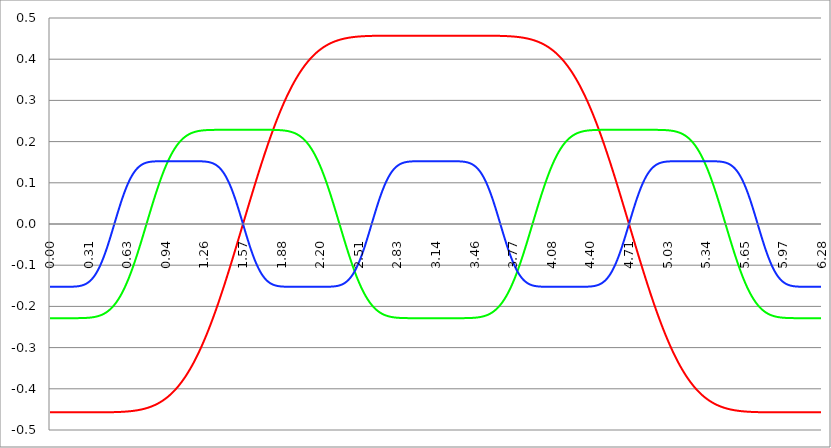
| Category | Series 1 | Series 0 | Series 2 |
|---|---|---|---|
| 0.0 | -0.457 | -0.229 | -0.152 |
| 0.00314159265358979 | -0.457 | -0.229 | -0.152 |
| 0.00628318530717958 | -0.457 | -0.229 | -0.152 |
| 0.00942477796076938 | -0.457 | -0.229 | -0.152 |
| 0.0125663706143592 | -0.457 | -0.229 | -0.152 |
| 0.015707963267949 | -0.457 | -0.229 | -0.152 |
| 0.0188495559215388 | -0.457 | -0.229 | -0.152 |
| 0.0219911485751285 | -0.457 | -0.229 | -0.152 |
| 0.0251327412287183 | -0.457 | -0.229 | -0.152 |
| 0.0282743338823081 | -0.457 | -0.229 | -0.152 |
| 0.0314159265358979 | -0.457 | -0.229 | -0.152 |
| 0.0345575191894877 | -0.457 | -0.229 | -0.152 |
| 0.0376991118430775 | -0.457 | -0.229 | -0.152 |
| 0.0408407044966673 | -0.457 | -0.229 | -0.152 |
| 0.0439822971502571 | -0.457 | -0.229 | -0.152 |
| 0.0471238898038469 | -0.457 | -0.229 | -0.152 |
| 0.0502654824574367 | -0.457 | -0.229 | -0.152 |
| 0.0534070751110265 | -0.457 | -0.229 | -0.152 |
| 0.0565486677646163 | -0.457 | -0.229 | -0.152 |
| 0.059690260418206 | -0.457 | -0.229 | -0.152 |
| 0.0628318530717958 | -0.457 | -0.229 | -0.152 |
| 0.0659734457253856 | -0.457 | -0.229 | -0.152 |
| 0.0691150383789754 | -0.457 | -0.229 | -0.152 |
| 0.0722566310325652 | -0.457 | -0.229 | -0.152 |
| 0.075398223686155 | -0.457 | -0.229 | -0.152 |
| 0.0785398163397448 | -0.457 | -0.229 | -0.152 |
| 0.0816814089933346 | -0.457 | -0.229 | -0.152 |
| 0.0848230016469244 | -0.457 | -0.229 | -0.152 |
| 0.0879645943005142 | -0.457 | -0.229 | -0.152 |
| 0.091106186954104 | -0.457 | -0.229 | -0.152 |
| 0.0942477796076937 | -0.457 | -0.229 | -0.152 |
| 0.0973893722612835 | -0.457 | -0.229 | -0.152 |
| 0.100530964914873 | -0.457 | -0.229 | -0.152 |
| 0.103672557568463 | -0.457 | -0.229 | -0.152 |
| 0.106814150222053 | -0.457 | -0.229 | -0.152 |
| 0.109955742875643 | -0.457 | -0.229 | -0.152 |
| 0.113097335529233 | -0.457 | -0.229 | -0.152 |
| 0.116238928182822 | -0.457 | -0.229 | -0.152 |
| 0.119380520836412 | -0.457 | -0.229 | -0.152 |
| 0.122522113490002 | -0.457 | -0.229 | -0.152 |
| 0.125663706143592 | -0.457 | -0.229 | -0.152 |
| 0.128805298797181 | -0.457 | -0.229 | -0.152 |
| 0.131946891450771 | -0.457 | -0.229 | -0.152 |
| 0.135088484104361 | -0.457 | -0.229 | -0.152 |
| 0.138230076757951 | -0.457 | -0.229 | -0.152 |
| 0.141371669411541 | -0.457 | -0.229 | -0.152 |
| 0.14451326206513 | -0.457 | -0.229 | -0.152 |
| 0.14765485471872 | -0.457 | -0.229 | -0.152 |
| 0.15079644737231 | -0.457 | -0.229 | -0.152 |
| 0.1539380400259 | -0.457 | -0.229 | -0.152 |
| 0.15707963267949 | -0.457 | -0.229 | -0.152 |
| 0.160221225333079 | -0.457 | -0.229 | -0.152 |
| 0.163362817986669 | -0.457 | -0.229 | -0.152 |
| 0.166504410640259 | -0.457 | -0.229 | -0.152 |
| 0.169646003293849 | -0.457 | -0.229 | -0.152 |
| 0.172787595947439 | -0.457 | -0.229 | -0.152 |
| 0.175929188601028 | -0.457 | -0.229 | -0.152 |
| 0.179070781254618 | -0.457 | -0.229 | -0.152 |
| 0.182212373908208 | -0.457 | -0.229 | -0.152 |
| 0.185353966561798 | -0.457 | -0.229 | -0.152 |
| 0.188495559215388 | -0.457 | -0.229 | -0.152 |
| 0.191637151868977 | -0.457 | -0.229 | -0.152 |
| 0.194778744522567 | -0.457 | -0.229 | -0.152 |
| 0.197920337176157 | -0.457 | -0.229 | -0.152 |
| 0.201061929829747 | -0.457 | -0.229 | -0.152 |
| 0.204203522483336 | -0.457 | -0.229 | -0.152 |
| 0.207345115136926 | -0.457 | -0.229 | -0.152 |
| 0.210486707790516 | -0.457 | -0.229 | -0.152 |
| 0.213628300444106 | -0.457 | -0.229 | -0.152 |
| 0.216769893097696 | -0.457 | -0.229 | -0.151 |
| 0.219911485751285 | -0.457 | -0.228 | -0.151 |
| 0.223053078404875 | -0.457 | -0.228 | -0.151 |
| 0.226194671058465 | -0.457 | -0.228 | -0.151 |
| 0.229336263712055 | -0.457 | -0.228 | -0.151 |
| 0.232477856365645 | -0.457 | -0.228 | -0.151 |
| 0.235619449019234 | -0.457 | -0.228 | -0.151 |
| 0.238761041672824 | -0.457 | -0.228 | -0.151 |
| 0.241902634326414 | -0.457 | -0.228 | -0.15 |
| 0.245044226980004 | -0.457 | -0.228 | -0.15 |
| 0.248185819633594 | -0.457 | -0.228 | -0.15 |
| 0.251327412287183 | -0.457 | -0.228 | -0.15 |
| 0.254469004940773 | -0.457 | -0.228 | -0.15 |
| 0.257610597594363 | -0.457 | -0.228 | -0.149 |
| 0.260752190247953 | -0.457 | -0.228 | -0.149 |
| 0.263893782901543 | -0.457 | -0.228 | -0.149 |
| 0.267035375555132 | -0.457 | -0.228 | -0.149 |
| 0.270176968208722 | -0.457 | -0.228 | -0.148 |
| 0.273318560862312 | -0.457 | -0.228 | -0.148 |
| 0.276460153515902 | -0.457 | -0.228 | -0.147 |
| 0.279601746169492 | -0.457 | -0.228 | -0.147 |
| 0.282743338823082 | -0.457 | -0.228 | -0.147 |
| 0.285884931476671 | -0.457 | -0.228 | -0.146 |
| 0.289026524130261 | -0.457 | -0.228 | -0.146 |
| 0.292168116783851 | -0.457 | -0.228 | -0.145 |
| 0.295309709437441 | -0.457 | -0.228 | -0.145 |
| 0.298451302091031 | -0.457 | -0.228 | -0.144 |
| 0.30159289474462 | -0.457 | -0.228 | -0.144 |
| 0.30473448739821 | -0.457 | -0.228 | -0.143 |
| 0.3078760800518 | -0.457 | -0.228 | -0.142 |
| 0.31101767270539 | -0.457 | -0.228 | -0.142 |
| 0.31415926535898 | -0.457 | -0.228 | -0.141 |
| 0.31730085801257 | -0.457 | -0.227 | -0.14 |
| 0.320442450666159 | -0.457 | -0.227 | -0.14 |
| 0.323584043319749 | -0.457 | -0.227 | -0.139 |
| 0.326725635973339 | -0.457 | -0.227 | -0.138 |
| 0.329867228626929 | -0.457 | -0.227 | -0.137 |
| 0.333008821280519 | -0.457 | -0.227 | -0.136 |
| 0.336150413934108 | -0.457 | -0.227 | -0.135 |
| 0.339292006587698 | -0.457 | -0.227 | -0.134 |
| 0.342433599241288 | -0.457 | -0.227 | -0.133 |
| 0.345575191894878 | -0.457 | -0.226 | -0.132 |
| 0.348716784548468 | -0.457 | -0.226 | -0.131 |
| 0.351858377202058 | -0.457 | -0.226 | -0.13 |
| 0.354999969855647 | -0.457 | -0.226 | -0.129 |
| 0.358141562509237 | -0.457 | -0.226 | -0.127 |
| 0.361283155162827 | -0.457 | -0.226 | -0.126 |
| 0.364424747816417 | -0.457 | -0.226 | -0.125 |
| 0.367566340470007 | -0.457 | -0.225 | -0.123 |
| 0.370707933123597 | -0.457 | -0.225 | -0.122 |
| 0.373849525777186 | -0.457 | -0.225 | -0.12 |
| 0.376991118430776 | -0.457 | -0.225 | -0.119 |
| 0.380132711084366 | -0.457 | -0.225 | -0.117 |
| 0.383274303737956 | -0.457 | -0.224 | -0.116 |
| 0.386415896391546 | -0.457 | -0.224 | -0.114 |
| 0.389557489045135 | -0.457 | -0.224 | -0.112 |
| 0.392699081698725 | -0.457 | -0.223 | -0.11 |
| 0.395840674352315 | -0.457 | -0.223 | -0.109 |
| 0.398982267005905 | -0.457 | -0.223 | -0.107 |
| 0.402123859659495 | -0.457 | -0.223 | -0.105 |
| 0.405265452313085 | -0.457 | -0.222 | -0.103 |
| 0.408407044966674 | -0.457 | -0.222 | -0.101 |
| 0.411548637620264 | -0.457 | -0.222 | -0.099 |
| 0.414690230273854 | -0.457 | -0.221 | -0.097 |
| 0.417831822927444 | -0.457 | -0.221 | -0.094 |
| 0.420973415581034 | -0.457 | -0.22 | -0.092 |
| 0.424115008234623 | -0.457 | -0.22 | -0.09 |
| 0.427256600888213 | -0.457 | -0.22 | -0.088 |
| 0.430398193541803 | -0.457 | -0.219 | -0.085 |
| 0.433539786195393 | -0.457 | -0.219 | -0.083 |
| 0.436681378848983 | -0.457 | -0.218 | -0.08 |
| 0.439822971502573 | -0.457 | -0.218 | -0.078 |
| 0.442964564156162 | -0.457 | -0.217 | -0.075 |
| 0.446106156809752 | -0.457 | -0.217 | -0.073 |
| 0.449247749463342 | -0.457 | -0.216 | -0.07 |
| 0.452389342116932 | -0.457 | -0.216 | -0.068 |
| 0.455530934770522 | -0.457 | -0.215 | -0.065 |
| 0.458672527424111 | -0.457 | -0.214 | -0.062 |
| 0.461814120077701 | -0.457 | -0.214 | -0.059 |
| 0.464955712731291 | -0.457 | -0.213 | -0.057 |
| 0.468097305384881 | -0.457 | -0.212 | -0.054 |
| 0.471238898038471 | -0.457 | -0.212 | -0.051 |
| 0.474380490692061 | -0.457 | -0.211 | -0.048 |
| 0.47752208334565 | -0.457 | -0.21 | -0.045 |
| 0.48066367599924 | -0.457 | -0.209 | -0.042 |
| 0.48380526865283 | -0.457 | -0.209 | -0.039 |
| 0.48694686130642 | -0.457 | -0.208 | -0.036 |
| 0.49008845396001 | -0.457 | -0.207 | -0.033 |
| 0.493230046613599 | -0.457 | -0.206 | -0.03 |
| 0.496371639267189 | -0.457 | -0.205 | -0.027 |
| 0.499513231920779 | -0.457 | -0.204 | -0.024 |
| 0.502654824574369 | -0.457 | -0.203 | -0.021 |
| 0.505796417227959 | -0.457 | -0.202 | -0.018 |
| 0.508938009881549 | -0.457 | -0.201 | -0.015 |
| 0.512079602535138 | -0.457 | -0.2 | -0.012 |
| 0.515221195188728 | -0.457 | -0.199 | -0.008 |
| 0.518362787842318 | -0.457 | -0.198 | -0.005 |
| 0.521504380495908 | -0.457 | -0.197 | -0.002 |
| 0.524645973149498 | -0.457 | -0.196 | 0.001 |
| 0.527787565803087 | -0.457 | -0.195 | 0.004 |
| 0.530929158456677 | -0.457 | -0.194 | 0.007 |
| 0.534070751110267 | -0.457 | -0.192 | 0.01 |
| 0.537212343763857 | -0.456 | -0.191 | 0.014 |
| 0.540353936417447 | -0.456 | -0.19 | 0.017 |
| 0.543495529071037 | -0.456 | -0.188 | 0.02 |
| 0.546637121724626 | -0.456 | -0.187 | 0.023 |
| 0.549778714378216 | -0.456 | -0.186 | 0.026 |
| 0.552920307031806 | -0.456 | -0.184 | 0.029 |
| 0.556061899685396 | -0.456 | -0.183 | 0.032 |
| 0.559203492338986 | -0.456 | -0.181 | 0.035 |
| 0.562345084992576 | -0.456 | -0.18 | 0.038 |
| 0.565486677646165 | -0.456 | -0.178 | 0.041 |
| 0.568628270299755 | -0.456 | -0.177 | 0.044 |
| 0.571769862953345 | -0.456 | -0.175 | 0.047 |
| 0.574911455606935 | -0.456 | -0.173 | 0.05 |
| 0.578053048260525 | -0.456 | -0.172 | 0.053 |
| 0.581194640914114 | -0.456 | -0.17 | 0.056 |
| 0.584336233567704 | -0.456 | -0.168 | 0.058 |
| 0.587477826221294 | -0.456 | -0.167 | 0.061 |
| 0.590619418874884 | -0.456 | -0.165 | 0.064 |
| 0.593761011528474 | -0.456 | -0.163 | 0.067 |
| 0.596902604182064 | -0.456 | -0.161 | 0.069 |
| 0.600044196835653 | -0.456 | -0.159 | 0.072 |
| 0.603185789489243 | -0.456 | -0.157 | 0.075 |
| 0.606327382142833 | -0.456 | -0.155 | 0.077 |
| 0.609468974796423 | -0.455 | -0.153 | 0.08 |
| 0.612610567450013 | -0.455 | -0.151 | 0.082 |
| 0.615752160103602 | -0.455 | -0.149 | 0.085 |
| 0.618893752757192 | -0.455 | -0.147 | 0.087 |
| 0.622035345410782 | -0.455 | -0.145 | 0.089 |
| 0.625176938064372 | -0.455 | -0.143 | 0.091 |
| 0.628318530717962 | -0.455 | -0.141 | 0.094 |
| 0.631460123371551 | -0.455 | -0.138 | 0.096 |
| 0.634601716025141 | -0.455 | -0.136 | 0.098 |
| 0.637743308678731 | -0.455 | -0.134 | 0.1 |
| 0.640884901332321 | -0.455 | -0.131 | 0.102 |
| 0.644026493985911 | -0.455 | -0.129 | 0.104 |
| 0.647168086639501 | -0.455 | -0.127 | 0.106 |
| 0.65030967929309 | -0.454 | -0.124 | 0.108 |
| 0.65345127194668 | -0.454 | -0.122 | 0.11 |
| 0.65659286460027 | -0.454 | -0.119 | 0.112 |
| 0.65973445725386 | -0.454 | -0.117 | 0.113 |
| 0.66287604990745 | -0.454 | -0.114 | 0.115 |
| 0.666017642561039 | -0.454 | -0.112 | 0.117 |
| 0.669159235214629 | -0.454 | -0.109 | 0.118 |
| 0.672300827868219 | -0.454 | -0.107 | 0.12 |
| 0.675442420521809 | -0.454 | -0.104 | 0.121 |
| 0.678584013175399 | -0.453 | -0.101 | 0.123 |
| 0.681725605828989 | -0.453 | -0.099 | 0.124 |
| 0.684867198482578 | -0.453 | -0.096 | 0.126 |
| 0.688008791136168 | -0.453 | -0.093 | 0.127 |
| 0.691150383789758 | -0.453 | -0.09 | 0.128 |
| 0.694291976443348 | -0.453 | -0.088 | 0.129 |
| 0.697433569096938 | -0.453 | -0.085 | 0.131 |
| 0.700575161750528 | -0.453 | -0.082 | 0.132 |
| 0.703716754404117 | -0.452 | -0.079 | 0.133 |
| 0.706858347057707 | -0.452 | -0.076 | 0.134 |
| 0.709999939711297 | -0.452 | -0.073 | 0.135 |
| 0.713141532364887 | -0.452 | -0.071 | 0.136 |
| 0.716283125018477 | -0.452 | -0.068 | 0.137 |
| 0.719424717672066 | -0.452 | -0.065 | 0.138 |
| 0.722566310325656 | -0.451 | -0.062 | 0.139 |
| 0.725707902979246 | -0.451 | -0.059 | 0.139 |
| 0.728849495632836 | -0.451 | -0.056 | 0.14 |
| 0.731991088286426 | -0.451 | -0.053 | 0.141 |
| 0.735132680940016 | -0.451 | -0.05 | 0.142 |
| 0.738274273593605 | -0.451 | -0.047 | 0.142 |
| 0.741415866247195 | -0.45 | -0.044 | 0.143 |
| 0.744557458900785 | -0.45 | -0.041 | 0.144 |
| 0.747699051554375 | -0.45 | -0.037 | 0.144 |
| 0.750840644207965 | -0.45 | -0.034 | 0.145 |
| 0.753982236861554 | -0.449 | -0.031 | 0.145 |
| 0.757123829515144 | -0.449 | -0.028 | 0.146 |
| 0.760265422168734 | -0.449 | -0.025 | 0.146 |
| 0.763407014822324 | -0.449 | -0.022 | 0.147 |
| 0.766548607475914 | -0.449 | -0.019 | 0.147 |
| 0.769690200129504 | -0.448 | -0.016 | 0.147 |
| 0.772831792783093 | -0.448 | -0.013 | 0.148 |
| 0.775973385436683 | -0.448 | -0.009 | 0.148 |
| 0.779114978090273 | -0.448 | -0.006 | 0.148 |
| 0.782256570743863 | -0.447 | -0.003 | 0.149 |
| 0.785398163397453 | -0.447 | 0 | 0.149 |
| 0.788539756051042 | -0.447 | 0.003 | 0.149 |
| 0.791681348704632 | -0.446 | 0.006 | 0.15 |
| 0.794822941358222 | -0.446 | 0.009 | 0.15 |
| 0.797964534011812 | -0.446 | 0.013 | 0.15 |
| 0.801106126665402 | -0.446 | 0.016 | 0.15 |
| 0.804247719318992 | -0.445 | 0.019 | 0.15 |
| 0.807389311972581 | -0.445 | 0.022 | 0.151 |
| 0.810530904626171 | -0.445 | 0.025 | 0.151 |
| 0.813672497279761 | -0.444 | 0.028 | 0.151 |
| 0.816814089933351 | -0.444 | 0.031 | 0.151 |
| 0.819955682586941 | -0.444 | 0.034 | 0.151 |
| 0.823097275240531 | -0.443 | 0.037 | 0.151 |
| 0.82623886789412 | -0.443 | 0.041 | 0.151 |
| 0.82938046054771 | -0.442 | 0.044 | 0.151 |
| 0.8325220532013 | -0.442 | 0.047 | 0.152 |
| 0.83566364585489 | -0.442 | 0.05 | 0.152 |
| 0.83880523850848 | -0.441 | 0.053 | 0.152 |
| 0.841946831162069 | -0.441 | 0.056 | 0.152 |
| 0.845088423815659 | -0.441 | 0.059 | 0.152 |
| 0.848230016469249 | -0.44 | 0.062 | 0.152 |
| 0.851371609122839 | -0.44 | 0.065 | 0.152 |
| 0.854513201776429 | -0.439 | 0.068 | 0.152 |
| 0.857654794430019 | -0.439 | 0.071 | 0.152 |
| 0.860796387083608 | -0.438 | 0.073 | 0.152 |
| 0.863937979737198 | -0.438 | 0.076 | 0.152 |
| 0.867079572390788 | -0.437 | 0.079 | 0.152 |
| 0.870221165044378 | -0.437 | 0.082 | 0.152 |
| 0.873362757697968 | -0.436 | 0.085 | 0.152 |
| 0.876504350351557 | -0.436 | 0.088 | 0.152 |
| 0.879645943005147 | -0.435 | 0.09 | 0.152 |
| 0.882787535658737 | -0.435 | 0.093 | 0.152 |
| 0.885929128312327 | -0.434 | 0.096 | 0.152 |
| 0.889070720965917 | -0.434 | 0.099 | 0.152 |
| 0.892212313619507 | -0.433 | 0.101 | 0.152 |
| 0.895353906273096 | -0.433 | 0.104 | 0.152 |
| 0.898495498926686 | -0.432 | 0.107 | 0.152 |
| 0.901637091580276 | -0.432 | 0.109 | 0.152 |
| 0.904778684233866 | -0.431 | 0.112 | 0.152 |
| 0.907920276887456 | -0.431 | 0.114 | 0.152 |
| 0.911061869541045 | -0.43 | 0.117 | 0.152 |
| 0.914203462194635 | -0.429 | 0.119 | 0.152 |
| 0.917345054848225 | -0.429 | 0.122 | 0.152 |
| 0.920486647501815 | -0.428 | 0.124 | 0.152 |
| 0.923628240155405 | -0.427 | 0.127 | 0.152 |
| 0.926769832808995 | -0.427 | 0.129 | 0.152 |
| 0.929911425462584 | -0.426 | 0.131 | 0.152 |
| 0.933053018116174 | -0.425 | 0.134 | 0.152 |
| 0.936194610769764 | -0.425 | 0.136 | 0.152 |
| 0.939336203423354 | -0.424 | 0.138 | 0.152 |
| 0.942477796076944 | -0.423 | 0.141 | 0.152 |
| 0.945619388730533 | -0.423 | 0.143 | 0.152 |
| 0.948760981384123 | -0.422 | 0.145 | 0.152 |
| 0.951902574037713 | -0.421 | 0.147 | 0.152 |
| 0.955044166691303 | -0.42 | 0.149 | 0.152 |
| 0.958185759344893 | -0.42 | 0.151 | 0.152 |
| 0.961327351998483 | -0.419 | 0.153 | 0.152 |
| 0.964468944652072 | -0.418 | 0.155 | 0.152 |
| 0.967610537305662 | -0.417 | 0.157 | 0.152 |
| 0.970752129959252 | -0.416 | 0.159 | 0.152 |
| 0.973893722612842 | -0.416 | 0.161 | 0.152 |
| 0.977035315266432 | -0.415 | 0.163 | 0.152 |
| 0.980176907920022 | -0.414 | 0.165 | 0.152 |
| 0.983318500573611 | -0.413 | 0.167 | 0.152 |
| 0.986460093227201 | -0.412 | 0.168 | 0.152 |
| 0.989601685880791 | -0.411 | 0.17 | 0.152 |
| 0.992743278534381 | -0.41 | 0.172 | 0.152 |
| 0.995884871187971 | -0.409 | 0.173 | 0.152 |
| 0.99902646384156 | -0.409 | 0.175 | 0.152 |
| 1.00216805649515 | -0.408 | 0.177 | 0.152 |
| 1.00530964914874 | -0.407 | 0.178 | 0.152 |
| 1.00845124180233 | -0.406 | 0.18 | 0.152 |
| 1.01159283445592 | -0.405 | 0.181 | 0.152 |
| 1.01473442710951 | -0.404 | 0.183 | 0.152 |
| 1.017876019763099 | -0.403 | 0.184 | 0.152 |
| 1.021017612416689 | -0.402 | 0.186 | 0.152 |
| 1.02415920507028 | -0.401 | 0.187 | 0.152 |
| 1.027300797723869 | -0.4 | 0.188 | 0.152 |
| 1.030442390377459 | -0.399 | 0.19 | 0.152 |
| 1.033583983031048 | -0.397 | 0.191 | 0.152 |
| 1.036725575684638 | -0.396 | 0.192 | 0.152 |
| 1.039867168338228 | -0.395 | 0.194 | 0.152 |
| 1.043008760991818 | -0.394 | 0.195 | 0.152 |
| 1.046150353645408 | -0.393 | 0.196 | 0.152 |
| 1.049291946298998 | -0.392 | 0.197 | 0.152 |
| 1.052433538952587 | -0.391 | 0.198 | 0.152 |
| 1.055575131606177 | -0.39 | 0.199 | 0.152 |
| 1.058716724259767 | -0.388 | 0.2 | 0.152 |
| 1.061858316913357 | -0.387 | 0.201 | 0.152 |
| 1.064999909566947 | -0.386 | 0.202 | 0.152 |
| 1.068141502220536 | -0.385 | 0.203 | 0.152 |
| 1.071283094874126 | -0.383 | 0.204 | 0.152 |
| 1.074424687527716 | -0.382 | 0.205 | 0.152 |
| 1.077566280181306 | -0.381 | 0.206 | 0.152 |
| 1.080707872834896 | -0.38 | 0.207 | 0.152 |
| 1.083849465488486 | -0.378 | 0.208 | 0.152 |
| 1.086991058142075 | -0.377 | 0.209 | 0.152 |
| 1.090132650795665 | -0.376 | 0.209 | 0.152 |
| 1.093274243449255 | -0.374 | 0.21 | 0.152 |
| 1.096415836102845 | -0.373 | 0.211 | 0.152 |
| 1.099557428756435 | -0.371 | 0.212 | 0.152 |
| 1.102699021410025 | -0.37 | 0.212 | 0.152 |
| 1.105840614063614 | -0.369 | 0.213 | 0.152 |
| 1.108982206717204 | -0.367 | 0.214 | 0.152 |
| 1.112123799370794 | -0.366 | 0.214 | 0.152 |
| 1.115265392024384 | -0.364 | 0.215 | 0.152 |
| 1.118406984677974 | -0.363 | 0.216 | 0.152 |
| 1.121548577331563 | -0.361 | 0.216 | 0.152 |
| 1.124690169985153 | -0.36 | 0.217 | 0.152 |
| 1.127831762638743 | -0.358 | 0.217 | 0.152 |
| 1.130973355292333 | -0.357 | 0.218 | 0.152 |
| 1.134114947945923 | -0.355 | 0.218 | 0.152 |
| 1.137256540599513 | -0.353 | 0.219 | 0.152 |
| 1.140398133253102 | -0.352 | 0.219 | 0.152 |
| 1.143539725906692 | -0.35 | 0.22 | 0.152 |
| 1.146681318560282 | -0.349 | 0.22 | 0.152 |
| 1.149822911213872 | -0.347 | 0.22 | 0.152 |
| 1.152964503867462 | -0.345 | 0.221 | 0.152 |
| 1.156106096521051 | -0.344 | 0.221 | 0.152 |
| 1.159247689174641 | -0.342 | 0.222 | 0.152 |
| 1.162389281828231 | -0.34 | 0.222 | 0.152 |
| 1.165530874481821 | -0.338 | 0.222 | 0.152 |
| 1.168672467135411 | -0.337 | 0.223 | 0.152 |
| 1.171814059789001 | -0.335 | 0.223 | 0.152 |
| 1.17495565244259 | -0.333 | 0.223 | 0.152 |
| 1.17809724509618 | -0.331 | 0.223 | 0.152 |
| 1.18123883774977 | -0.33 | 0.224 | 0.152 |
| 1.18438043040336 | -0.328 | 0.224 | 0.152 |
| 1.18752202305695 | -0.326 | 0.224 | 0.152 |
| 1.190663615710539 | -0.324 | 0.225 | 0.152 |
| 1.193805208364129 | -0.322 | 0.225 | 0.152 |
| 1.19694680101772 | -0.32 | 0.225 | 0.152 |
| 1.200088393671309 | -0.318 | 0.225 | 0.152 |
| 1.203229986324899 | -0.316 | 0.225 | 0.152 |
| 1.206371578978489 | -0.314 | 0.226 | 0.152 |
| 1.209513171632078 | -0.313 | 0.226 | 0.152 |
| 1.212654764285668 | -0.311 | 0.226 | 0.152 |
| 1.215796356939258 | -0.309 | 0.226 | 0.152 |
| 1.218937949592848 | -0.307 | 0.226 | 0.152 |
| 1.222079542246438 | -0.305 | 0.226 | 0.152 |
| 1.225221134900027 | -0.302 | 0.226 | 0.152 |
| 1.228362727553617 | -0.3 | 0.227 | 0.152 |
| 1.231504320207207 | -0.298 | 0.227 | 0.152 |
| 1.234645912860797 | -0.296 | 0.227 | 0.152 |
| 1.237787505514387 | -0.294 | 0.227 | 0.152 |
| 1.240929098167977 | -0.292 | 0.227 | 0.152 |
| 1.244070690821566 | -0.29 | 0.227 | 0.152 |
| 1.247212283475156 | -0.288 | 0.227 | 0.152 |
| 1.250353876128746 | -0.286 | 0.227 | 0.152 |
| 1.253495468782336 | -0.283 | 0.227 | 0.152 |
| 1.256637061435926 | -0.281 | 0.228 | 0.152 |
| 1.259778654089515 | -0.279 | 0.228 | 0.152 |
| 1.262920246743105 | -0.277 | 0.228 | 0.152 |
| 1.266061839396695 | -0.274 | 0.228 | 0.151 |
| 1.269203432050285 | -0.272 | 0.228 | 0.151 |
| 1.272345024703875 | -0.27 | 0.228 | 0.151 |
| 1.275486617357465 | -0.268 | 0.228 | 0.151 |
| 1.278628210011054 | -0.265 | 0.228 | 0.151 |
| 1.281769802664644 | -0.263 | 0.228 | 0.151 |
| 1.284911395318234 | -0.261 | 0.228 | 0.151 |
| 1.288052987971824 | -0.258 | 0.228 | 0.15 |
| 1.291194580625414 | -0.256 | 0.228 | 0.15 |
| 1.294336173279003 | -0.254 | 0.228 | 0.15 |
| 1.297477765932593 | -0.251 | 0.228 | 0.15 |
| 1.300619358586183 | -0.249 | 0.228 | 0.15 |
| 1.303760951239773 | -0.246 | 0.228 | 0.149 |
| 1.306902543893363 | -0.244 | 0.228 | 0.149 |
| 1.310044136546953 | -0.241 | 0.228 | 0.149 |
| 1.313185729200542 | -0.239 | 0.228 | 0.149 |
| 1.316327321854132 | -0.236 | 0.228 | 0.148 |
| 1.319468914507722 | -0.234 | 0.228 | 0.148 |
| 1.322610507161312 | -0.231 | 0.228 | 0.148 |
| 1.325752099814902 | -0.229 | 0.228 | 0.147 |
| 1.328893692468491 | -0.226 | 0.228 | 0.147 |
| 1.332035285122081 | -0.224 | 0.228 | 0.146 |
| 1.335176877775671 | -0.221 | 0.228 | 0.146 |
| 1.338318470429261 | -0.219 | 0.228 | 0.145 |
| 1.341460063082851 | -0.216 | 0.228 | 0.145 |
| 1.344601655736441 | -0.213 | 0.228 | 0.144 |
| 1.34774324839003 | -0.211 | 0.228 | 0.144 |
| 1.35088484104362 | -0.208 | 0.228 | 0.143 |
| 1.35402643369721 | -0.205 | 0.229 | 0.143 |
| 1.3571680263508 | -0.203 | 0.229 | 0.142 |
| 1.36030961900439 | -0.2 | 0.229 | 0.141 |
| 1.363451211657979 | -0.197 | 0.229 | 0.141 |
| 1.36659280431157 | -0.195 | 0.229 | 0.14 |
| 1.369734396965159 | -0.192 | 0.229 | 0.139 |
| 1.372875989618749 | -0.189 | 0.229 | 0.138 |
| 1.376017582272339 | -0.186 | 0.229 | 0.137 |
| 1.379159174925929 | -0.184 | 0.229 | 0.136 |
| 1.382300767579518 | -0.181 | 0.229 | 0.136 |
| 1.385442360233108 | -0.178 | 0.229 | 0.135 |
| 1.388583952886698 | -0.175 | 0.229 | 0.134 |
| 1.391725545540288 | -0.173 | 0.229 | 0.132 |
| 1.394867138193878 | -0.17 | 0.229 | 0.131 |
| 1.398008730847468 | -0.167 | 0.229 | 0.13 |
| 1.401150323501057 | -0.164 | 0.229 | 0.129 |
| 1.404291916154647 | -0.161 | 0.229 | 0.128 |
| 1.407433508808237 | -0.158 | 0.229 | 0.127 |
| 1.410575101461827 | -0.156 | 0.229 | 0.125 |
| 1.413716694115417 | -0.153 | 0.229 | 0.124 |
| 1.416858286769006 | -0.15 | 0.229 | 0.122 |
| 1.419999879422596 | -0.147 | 0.229 | 0.121 |
| 1.423141472076186 | -0.144 | 0.229 | 0.119 |
| 1.426283064729776 | -0.141 | 0.229 | 0.118 |
| 1.429424657383366 | -0.138 | 0.229 | 0.116 |
| 1.432566250036956 | -0.135 | 0.229 | 0.115 |
| 1.435707842690545 | -0.132 | 0.229 | 0.113 |
| 1.438849435344135 | -0.129 | 0.229 | 0.111 |
| 1.441991027997725 | -0.126 | 0.229 | 0.109 |
| 1.445132620651315 | -0.123 | 0.229 | 0.107 |
| 1.448274213304905 | -0.12 | 0.229 | 0.105 |
| 1.451415805958494 | -0.117 | 0.229 | 0.104 |
| 1.454557398612084 | -0.114 | 0.229 | 0.102 |
| 1.457698991265674 | -0.111 | 0.229 | 0.099 |
| 1.460840583919264 | -0.108 | 0.229 | 0.097 |
| 1.463982176572854 | -0.105 | 0.229 | 0.095 |
| 1.467123769226444 | -0.102 | 0.229 | 0.093 |
| 1.470265361880033 | -0.099 | 0.229 | 0.091 |
| 1.473406954533623 | -0.096 | 0.229 | 0.088 |
| 1.476548547187213 | -0.093 | 0.229 | 0.086 |
| 1.479690139840803 | -0.09 | 0.229 | 0.084 |
| 1.482831732494393 | -0.087 | 0.229 | 0.081 |
| 1.485973325147982 | -0.084 | 0.229 | 0.079 |
| 1.489114917801572 | -0.081 | 0.229 | 0.076 |
| 1.492256510455162 | -0.078 | 0.229 | 0.074 |
| 1.495398103108752 | -0.075 | 0.229 | 0.071 |
| 1.498539695762342 | -0.072 | 0.229 | 0.068 |
| 1.501681288415932 | -0.069 | 0.229 | 0.066 |
| 1.504822881069521 | -0.066 | 0.229 | 0.063 |
| 1.507964473723111 | -0.063 | 0.229 | 0.06 |
| 1.511106066376701 | -0.059 | 0.229 | 0.058 |
| 1.514247659030291 | -0.056 | 0.229 | 0.055 |
| 1.517389251683881 | -0.053 | 0.229 | 0.052 |
| 1.520530844337471 | -0.05 | 0.229 | 0.049 |
| 1.52367243699106 | -0.047 | 0.229 | 0.046 |
| 1.52681402964465 | -0.044 | 0.229 | 0.043 |
| 1.52995562229824 | -0.041 | 0.229 | 0.04 |
| 1.53309721495183 | -0.038 | 0.229 | 0.037 |
| 1.53623880760542 | -0.035 | 0.229 | 0.034 |
| 1.539380400259009 | -0.031 | 0.229 | 0.031 |
| 1.542521992912599 | -0.028 | 0.229 | 0.028 |
| 1.545663585566189 | -0.025 | 0.229 | 0.025 |
| 1.548805178219779 | -0.022 | 0.229 | 0.022 |
| 1.551946770873369 | -0.019 | 0.229 | 0.019 |
| 1.555088363526959 | -0.016 | 0.229 | 0.016 |
| 1.558229956180548 | -0.013 | 0.229 | 0.013 |
| 1.561371548834138 | -0.009 | 0.229 | 0.009 |
| 1.564513141487728 | -0.006 | 0.229 | 0.006 |
| 1.567654734141318 | -0.003 | 0.229 | 0.003 |
| 1.570796326794908 | 0 | 0.229 | 0 |
| 1.573937919448497 | 0.003 | 0.229 | -0.003 |
| 1.577079512102087 | 0.006 | 0.229 | -0.006 |
| 1.580221104755677 | 0.009 | 0.229 | -0.009 |
| 1.583362697409267 | 0.013 | 0.229 | -0.013 |
| 1.586504290062857 | 0.016 | 0.229 | -0.016 |
| 1.589645882716447 | 0.019 | 0.229 | -0.019 |
| 1.592787475370036 | 0.022 | 0.229 | -0.022 |
| 1.595929068023626 | 0.025 | 0.229 | -0.025 |
| 1.599070660677216 | 0.028 | 0.229 | -0.028 |
| 1.602212253330806 | 0.031 | 0.229 | -0.031 |
| 1.605353845984396 | 0.035 | 0.229 | -0.034 |
| 1.608495438637985 | 0.038 | 0.229 | -0.037 |
| 1.611637031291575 | 0.041 | 0.229 | -0.04 |
| 1.614778623945165 | 0.044 | 0.229 | -0.043 |
| 1.617920216598755 | 0.047 | 0.229 | -0.046 |
| 1.621061809252345 | 0.05 | 0.229 | -0.049 |
| 1.624203401905935 | 0.053 | 0.229 | -0.052 |
| 1.627344994559524 | 0.056 | 0.229 | -0.055 |
| 1.630486587213114 | 0.059 | 0.229 | -0.058 |
| 1.633628179866704 | 0.063 | 0.229 | -0.06 |
| 1.636769772520294 | 0.066 | 0.229 | -0.063 |
| 1.639911365173884 | 0.069 | 0.229 | -0.066 |
| 1.643052957827473 | 0.072 | 0.229 | -0.068 |
| 1.646194550481063 | 0.075 | 0.229 | -0.071 |
| 1.649336143134653 | 0.078 | 0.229 | -0.074 |
| 1.652477735788243 | 0.081 | 0.229 | -0.076 |
| 1.655619328441833 | 0.084 | 0.229 | -0.079 |
| 1.658760921095423 | 0.087 | 0.229 | -0.081 |
| 1.661902513749012 | 0.09 | 0.229 | -0.084 |
| 1.665044106402602 | 0.093 | 0.229 | -0.086 |
| 1.668185699056192 | 0.096 | 0.229 | -0.088 |
| 1.671327291709782 | 0.099 | 0.229 | -0.091 |
| 1.674468884363372 | 0.102 | 0.229 | -0.093 |
| 1.677610477016961 | 0.105 | 0.229 | -0.095 |
| 1.680752069670551 | 0.108 | 0.229 | -0.097 |
| 1.683893662324141 | 0.111 | 0.229 | -0.099 |
| 1.687035254977731 | 0.114 | 0.229 | -0.102 |
| 1.690176847631321 | 0.117 | 0.229 | -0.104 |
| 1.693318440284911 | 0.12 | 0.229 | -0.105 |
| 1.6964600329385 | 0.123 | 0.229 | -0.107 |
| 1.69960162559209 | 0.126 | 0.229 | -0.109 |
| 1.70274321824568 | 0.129 | 0.229 | -0.111 |
| 1.70588481089927 | 0.132 | 0.229 | -0.113 |
| 1.70902640355286 | 0.135 | 0.229 | -0.115 |
| 1.712167996206449 | 0.138 | 0.229 | -0.116 |
| 1.715309588860039 | 0.141 | 0.229 | -0.118 |
| 1.71845118151363 | 0.144 | 0.229 | -0.119 |
| 1.721592774167219 | 0.147 | 0.229 | -0.121 |
| 1.724734366820809 | 0.15 | 0.229 | -0.122 |
| 1.727875959474399 | 0.153 | 0.229 | -0.124 |
| 1.731017552127988 | 0.156 | 0.229 | -0.125 |
| 1.734159144781578 | 0.158 | 0.229 | -0.127 |
| 1.737300737435168 | 0.161 | 0.229 | -0.128 |
| 1.740442330088758 | 0.164 | 0.229 | -0.129 |
| 1.743583922742348 | 0.167 | 0.229 | -0.13 |
| 1.746725515395937 | 0.17 | 0.229 | -0.131 |
| 1.749867108049527 | 0.173 | 0.229 | -0.132 |
| 1.753008700703117 | 0.175 | 0.229 | -0.134 |
| 1.756150293356707 | 0.178 | 0.229 | -0.135 |
| 1.759291886010297 | 0.181 | 0.229 | -0.136 |
| 1.762433478663887 | 0.184 | 0.229 | -0.136 |
| 1.765575071317476 | 0.186 | 0.229 | -0.137 |
| 1.768716663971066 | 0.189 | 0.229 | -0.138 |
| 1.771858256624656 | 0.192 | 0.229 | -0.139 |
| 1.774999849278246 | 0.195 | 0.229 | -0.14 |
| 1.778141441931836 | 0.197 | 0.229 | -0.141 |
| 1.781283034585426 | 0.2 | 0.229 | -0.141 |
| 1.784424627239015 | 0.203 | 0.229 | -0.142 |
| 1.787566219892605 | 0.205 | 0.229 | -0.143 |
| 1.790707812546195 | 0.208 | 0.228 | -0.143 |
| 1.793849405199785 | 0.211 | 0.228 | -0.144 |
| 1.796990997853375 | 0.213 | 0.228 | -0.144 |
| 1.800132590506964 | 0.216 | 0.228 | -0.145 |
| 1.803274183160554 | 0.219 | 0.228 | -0.145 |
| 1.806415775814144 | 0.221 | 0.228 | -0.146 |
| 1.809557368467734 | 0.224 | 0.228 | -0.146 |
| 1.812698961121324 | 0.226 | 0.228 | -0.147 |
| 1.815840553774914 | 0.229 | 0.228 | -0.147 |
| 1.818982146428503 | 0.231 | 0.228 | -0.148 |
| 1.822123739082093 | 0.234 | 0.228 | -0.148 |
| 1.825265331735683 | 0.236 | 0.228 | -0.148 |
| 1.828406924389273 | 0.239 | 0.228 | -0.149 |
| 1.831548517042863 | 0.241 | 0.228 | -0.149 |
| 1.834690109696452 | 0.244 | 0.228 | -0.149 |
| 1.837831702350042 | 0.246 | 0.228 | -0.149 |
| 1.840973295003632 | 0.249 | 0.228 | -0.15 |
| 1.844114887657222 | 0.251 | 0.228 | -0.15 |
| 1.847256480310812 | 0.254 | 0.228 | -0.15 |
| 1.850398072964402 | 0.256 | 0.228 | -0.15 |
| 1.853539665617991 | 0.258 | 0.228 | -0.15 |
| 1.856681258271581 | 0.261 | 0.228 | -0.151 |
| 1.859822850925171 | 0.263 | 0.228 | -0.151 |
| 1.862964443578761 | 0.265 | 0.228 | -0.151 |
| 1.866106036232351 | 0.268 | 0.228 | -0.151 |
| 1.86924762888594 | 0.27 | 0.228 | -0.151 |
| 1.87238922153953 | 0.272 | 0.228 | -0.151 |
| 1.87553081419312 | 0.274 | 0.228 | -0.151 |
| 1.87867240684671 | 0.277 | 0.228 | -0.152 |
| 1.8818139995003 | 0.279 | 0.228 | -0.152 |
| 1.88495559215389 | 0.281 | 0.228 | -0.152 |
| 1.888097184807479 | 0.283 | 0.227 | -0.152 |
| 1.891238777461069 | 0.286 | 0.227 | -0.152 |
| 1.89438037011466 | 0.288 | 0.227 | -0.152 |
| 1.897521962768249 | 0.29 | 0.227 | -0.152 |
| 1.900663555421839 | 0.292 | 0.227 | -0.152 |
| 1.903805148075429 | 0.294 | 0.227 | -0.152 |
| 1.906946740729018 | 0.296 | 0.227 | -0.152 |
| 1.910088333382608 | 0.298 | 0.227 | -0.152 |
| 1.913229926036198 | 0.3 | 0.227 | -0.152 |
| 1.916371518689788 | 0.302 | 0.226 | -0.152 |
| 1.919513111343378 | 0.305 | 0.226 | -0.152 |
| 1.922654703996967 | 0.307 | 0.226 | -0.152 |
| 1.925796296650557 | 0.309 | 0.226 | -0.152 |
| 1.928937889304147 | 0.311 | 0.226 | -0.152 |
| 1.932079481957737 | 0.313 | 0.226 | -0.152 |
| 1.935221074611327 | 0.314 | 0.226 | -0.152 |
| 1.938362667264917 | 0.316 | 0.225 | -0.152 |
| 1.941504259918506 | 0.318 | 0.225 | -0.152 |
| 1.944645852572096 | 0.32 | 0.225 | -0.152 |
| 1.947787445225686 | 0.322 | 0.225 | -0.152 |
| 1.950929037879276 | 0.324 | 0.225 | -0.152 |
| 1.954070630532866 | 0.326 | 0.224 | -0.152 |
| 1.957212223186455 | 0.328 | 0.224 | -0.152 |
| 1.960353815840045 | 0.33 | 0.224 | -0.152 |
| 1.963495408493635 | 0.331 | 0.223 | -0.152 |
| 1.966637001147225 | 0.333 | 0.223 | -0.152 |
| 1.969778593800815 | 0.335 | 0.223 | -0.152 |
| 1.972920186454405 | 0.337 | 0.223 | -0.152 |
| 1.976061779107994 | 0.338 | 0.222 | -0.152 |
| 1.979203371761584 | 0.34 | 0.222 | -0.152 |
| 1.982344964415174 | 0.342 | 0.222 | -0.152 |
| 1.985486557068764 | 0.344 | 0.221 | -0.152 |
| 1.988628149722354 | 0.345 | 0.221 | -0.152 |
| 1.991769742375943 | 0.347 | 0.22 | -0.152 |
| 1.994911335029533 | 0.349 | 0.22 | -0.152 |
| 1.998052927683123 | 0.35 | 0.22 | -0.152 |
| 2.001194520336712 | 0.352 | 0.219 | -0.152 |
| 2.004336112990302 | 0.353 | 0.219 | -0.152 |
| 2.007477705643892 | 0.355 | 0.218 | -0.152 |
| 2.010619298297482 | 0.357 | 0.218 | -0.152 |
| 2.013760890951071 | 0.358 | 0.217 | -0.152 |
| 2.016902483604661 | 0.36 | 0.217 | -0.152 |
| 2.02004407625825 | 0.361 | 0.216 | -0.152 |
| 2.02318566891184 | 0.363 | 0.216 | -0.152 |
| 2.02632726156543 | 0.364 | 0.215 | -0.152 |
| 2.029468854219019 | 0.366 | 0.214 | -0.152 |
| 2.032610446872609 | 0.367 | 0.214 | -0.152 |
| 2.035752039526198 | 0.369 | 0.213 | -0.152 |
| 2.038893632179788 | 0.37 | 0.212 | -0.152 |
| 2.042035224833378 | 0.371 | 0.212 | -0.152 |
| 2.045176817486967 | 0.373 | 0.211 | -0.152 |
| 2.048318410140557 | 0.374 | 0.21 | -0.152 |
| 2.051460002794146 | 0.376 | 0.209 | -0.152 |
| 2.054601595447736 | 0.377 | 0.209 | -0.152 |
| 2.057743188101325 | 0.378 | 0.208 | -0.152 |
| 2.060884780754915 | 0.38 | 0.207 | -0.152 |
| 2.064026373408505 | 0.381 | 0.206 | -0.152 |
| 2.067167966062094 | 0.382 | 0.205 | -0.152 |
| 2.070309558715684 | 0.383 | 0.204 | -0.152 |
| 2.073451151369273 | 0.385 | 0.203 | -0.152 |
| 2.076592744022863 | 0.386 | 0.202 | -0.152 |
| 2.079734336676452 | 0.387 | 0.201 | -0.152 |
| 2.082875929330042 | 0.388 | 0.2 | -0.152 |
| 2.086017521983632 | 0.39 | 0.199 | -0.152 |
| 2.089159114637221 | 0.391 | 0.198 | -0.152 |
| 2.092300707290811 | 0.392 | 0.197 | -0.152 |
| 2.095442299944401 | 0.393 | 0.196 | -0.152 |
| 2.09858389259799 | 0.394 | 0.195 | -0.152 |
| 2.10172548525158 | 0.395 | 0.194 | -0.152 |
| 2.104867077905169 | 0.396 | 0.192 | -0.152 |
| 2.108008670558759 | 0.397 | 0.191 | -0.152 |
| 2.111150263212349 | 0.399 | 0.19 | -0.152 |
| 2.114291855865938 | 0.4 | 0.188 | -0.152 |
| 2.117433448519528 | 0.401 | 0.187 | -0.152 |
| 2.120575041173117 | 0.402 | 0.186 | -0.152 |
| 2.123716633826707 | 0.403 | 0.184 | -0.152 |
| 2.126858226480297 | 0.404 | 0.183 | -0.152 |
| 2.129999819133886 | 0.405 | 0.181 | -0.152 |
| 2.133141411787476 | 0.406 | 0.18 | -0.152 |
| 2.136283004441065 | 0.407 | 0.178 | -0.152 |
| 2.139424597094655 | 0.408 | 0.177 | -0.152 |
| 2.142566189748245 | 0.409 | 0.175 | -0.152 |
| 2.145707782401834 | 0.409 | 0.173 | -0.152 |
| 2.148849375055424 | 0.41 | 0.172 | -0.152 |
| 2.151990967709013 | 0.411 | 0.17 | -0.152 |
| 2.155132560362603 | 0.412 | 0.168 | -0.152 |
| 2.158274153016193 | 0.413 | 0.167 | -0.152 |
| 2.161415745669782 | 0.414 | 0.165 | -0.152 |
| 2.164557338323372 | 0.415 | 0.163 | -0.152 |
| 2.167698930976961 | 0.416 | 0.161 | -0.152 |
| 2.170840523630551 | 0.416 | 0.159 | -0.152 |
| 2.173982116284141 | 0.417 | 0.157 | -0.152 |
| 2.17712370893773 | 0.418 | 0.155 | -0.152 |
| 2.18026530159132 | 0.419 | 0.153 | -0.152 |
| 2.183406894244909 | 0.42 | 0.151 | -0.152 |
| 2.186548486898499 | 0.42 | 0.149 | -0.152 |
| 2.189690079552089 | 0.421 | 0.147 | -0.152 |
| 2.192831672205678 | 0.422 | 0.145 | -0.152 |
| 2.195973264859268 | 0.423 | 0.143 | -0.152 |
| 2.199114857512857 | 0.423 | 0.141 | -0.152 |
| 2.202256450166447 | 0.424 | 0.138 | -0.152 |
| 2.205398042820036 | 0.425 | 0.136 | -0.152 |
| 2.208539635473626 | 0.425 | 0.134 | -0.152 |
| 2.211681228127216 | 0.426 | 0.131 | -0.152 |
| 2.214822820780805 | 0.427 | 0.129 | -0.152 |
| 2.217964413434395 | 0.427 | 0.127 | -0.152 |
| 2.221106006087984 | 0.428 | 0.124 | -0.152 |
| 2.224247598741574 | 0.429 | 0.122 | -0.152 |
| 2.227389191395164 | 0.429 | 0.119 | -0.152 |
| 2.230530784048753 | 0.43 | 0.117 | -0.152 |
| 2.233672376702343 | 0.431 | 0.114 | -0.152 |
| 2.236813969355933 | 0.431 | 0.112 | -0.152 |
| 2.239955562009522 | 0.432 | 0.109 | -0.152 |
| 2.243097154663112 | 0.432 | 0.107 | -0.152 |
| 2.246238747316701 | 0.433 | 0.104 | -0.152 |
| 2.249380339970291 | 0.433 | 0.101 | -0.152 |
| 2.252521932623881 | 0.434 | 0.099 | -0.152 |
| 2.25566352527747 | 0.434 | 0.096 | -0.152 |
| 2.25880511793106 | 0.435 | 0.093 | -0.152 |
| 2.261946710584649 | 0.435 | 0.09 | -0.152 |
| 2.265088303238239 | 0.436 | 0.088 | -0.152 |
| 2.268229895891829 | 0.436 | 0.085 | -0.152 |
| 2.271371488545418 | 0.437 | 0.082 | -0.152 |
| 2.274513081199008 | 0.437 | 0.079 | -0.152 |
| 2.277654673852597 | 0.438 | 0.076 | -0.152 |
| 2.280796266506186 | 0.438 | 0.073 | -0.152 |
| 2.283937859159776 | 0.439 | 0.071 | -0.152 |
| 2.287079451813366 | 0.439 | 0.068 | -0.152 |
| 2.290221044466955 | 0.44 | 0.065 | -0.152 |
| 2.293362637120545 | 0.44 | 0.062 | -0.152 |
| 2.296504229774135 | 0.441 | 0.059 | -0.152 |
| 2.299645822427724 | 0.441 | 0.056 | -0.152 |
| 2.302787415081314 | 0.441 | 0.053 | -0.152 |
| 2.305929007734904 | 0.442 | 0.05 | -0.152 |
| 2.309070600388493 | 0.442 | 0.047 | -0.152 |
| 2.312212193042083 | 0.442 | 0.044 | -0.151 |
| 2.315353785695672 | 0.443 | 0.041 | -0.151 |
| 2.318495378349262 | 0.443 | 0.037 | -0.151 |
| 2.321636971002852 | 0.444 | 0.034 | -0.151 |
| 2.324778563656441 | 0.444 | 0.031 | -0.151 |
| 2.327920156310031 | 0.444 | 0.028 | -0.151 |
| 2.33106174896362 | 0.445 | 0.025 | -0.151 |
| 2.33420334161721 | 0.445 | 0.022 | -0.151 |
| 2.3373449342708 | 0.445 | 0.019 | -0.15 |
| 2.340486526924389 | 0.446 | 0.016 | -0.15 |
| 2.343628119577979 | 0.446 | 0.013 | -0.15 |
| 2.346769712231568 | 0.446 | 0.009 | -0.15 |
| 2.349911304885158 | 0.446 | 0.006 | -0.15 |
| 2.353052897538748 | 0.447 | 0.003 | -0.149 |
| 2.356194490192337 | 0.447 | 0 | -0.149 |
| 2.359336082845927 | 0.447 | -0.003 | -0.149 |
| 2.362477675499516 | 0.448 | -0.006 | -0.148 |
| 2.365619268153106 | 0.448 | -0.009 | -0.148 |
| 2.368760860806696 | 0.448 | -0.013 | -0.148 |
| 2.371902453460285 | 0.448 | -0.016 | -0.147 |
| 2.375044046113875 | 0.449 | -0.019 | -0.147 |
| 2.378185638767464 | 0.449 | -0.022 | -0.147 |
| 2.381327231421054 | 0.449 | -0.025 | -0.146 |
| 2.384468824074644 | 0.449 | -0.028 | -0.146 |
| 2.387610416728233 | 0.449 | -0.031 | -0.145 |
| 2.390752009381823 | 0.45 | -0.034 | -0.145 |
| 2.393893602035412 | 0.45 | -0.037 | -0.144 |
| 2.397035194689002 | 0.45 | -0.041 | -0.144 |
| 2.400176787342591 | 0.45 | -0.044 | -0.143 |
| 2.403318379996181 | 0.451 | -0.047 | -0.142 |
| 2.406459972649771 | 0.451 | -0.05 | -0.142 |
| 2.40960156530336 | 0.451 | -0.053 | -0.141 |
| 2.41274315795695 | 0.451 | -0.056 | -0.14 |
| 2.41588475061054 | 0.451 | -0.059 | -0.139 |
| 2.419026343264129 | 0.451 | -0.062 | -0.139 |
| 2.422167935917719 | 0.452 | -0.065 | -0.138 |
| 2.425309528571308 | 0.452 | -0.068 | -0.137 |
| 2.428451121224898 | 0.452 | -0.071 | -0.136 |
| 2.431592713878488 | 0.452 | -0.073 | -0.135 |
| 2.434734306532077 | 0.452 | -0.076 | -0.134 |
| 2.437875899185667 | 0.452 | -0.079 | -0.133 |
| 2.441017491839256 | 0.453 | -0.082 | -0.132 |
| 2.444159084492846 | 0.453 | -0.085 | -0.131 |
| 2.447300677146435 | 0.453 | -0.088 | -0.129 |
| 2.450442269800025 | 0.453 | -0.09 | -0.128 |
| 2.453583862453615 | 0.453 | -0.093 | -0.127 |
| 2.456725455107204 | 0.453 | -0.096 | -0.126 |
| 2.459867047760794 | 0.453 | -0.099 | -0.124 |
| 2.463008640414384 | 0.453 | -0.101 | -0.123 |
| 2.466150233067973 | 0.454 | -0.104 | -0.121 |
| 2.469291825721563 | 0.454 | -0.107 | -0.12 |
| 2.472433418375152 | 0.454 | -0.109 | -0.118 |
| 2.475575011028742 | 0.454 | -0.112 | -0.117 |
| 2.478716603682332 | 0.454 | -0.114 | -0.115 |
| 2.481858196335921 | 0.454 | -0.117 | -0.113 |
| 2.48499978898951 | 0.454 | -0.119 | -0.112 |
| 2.4881413816431 | 0.454 | -0.122 | -0.11 |
| 2.49128297429669 | 0.454 | -0.124 | -0.108 |
| 2.49442456695028 | 0.455 | -0.127 | -0.106 |
| 2.497566159603869 | 0.455 | -0.129 | -0.104 |
| 2.500707752257458 | 0.455 | -0.131 | -0.102 |
| 2.503849344911048 | 0.455 | -0.134 | -0.1 |
| 2.506990937564638 | 0.455 | -0.136 | -0.098 |
| 2.510132530218228 | 0.455 | -0.138 | -0.096 |
| 2.513274122871817 | 0.455 | -0.141 | -0.094 |
| 2.516415715525407 | 0.455 | -0.143 | -0.091 |
| 2.519557308178996 | 0.455 | -0.145 | -0.089 |
| 2.522698900832586 | 0.455 | -0.147 | -0.087 |
| 2.525840493486176 | 0.455 | -0.149 | -0.085 |
| 2.528982086139765 | 0.455 | -0.151 | -0.082 |
| 2.532123678793355 | 0.455 | -0.153 | -0.08 |
| 2.535265271446944 | 0.456 | -0.155 | -0.077 |
| 2.538406864100534 | 0.456 | -0.157 | -0.075 |
| 2.541548456754124 | 0.456 | -0.159 | -0.072 |
| 2.544690049407713 | 0.456 | -0.161 | -0.069 |
| 2.547831642061302 | 0.456 | -0.163 | -0.067 |
| 2.550973234714892 | 0.456 | -0.165 | -0.064 |
| 2.554114827368482 | 0.456 | -0.167 | -0.061 |
| 2.557256420022072 | 0.456 | -0.168 | -0.058 |
| 2.560398012675661 | 0.456 | -0.17 | -0.056 |
| 2.563539605329251 | 0.456 | -0.172 | -0.053 |
| 2.56668119798284 | 0.456 | -0.173 | -0.05 |
| 2.56982279063643 | 0.456 | -0.175 | -0.047 |
| 2.57296438329002 | 0.456 | -0.177 | -0.044 |
| 2.576105975943609 | 0.456 | -0.178 | -0.041 |
| 2.579247568597199 | 0.456 | -0.18 | -0.038 |
| 2.582389161250788 | 0.456 | -0.181 | -0.035 |
| 2.585530753904377 | 0.456 | -0.183 | -0.032 |
| 2.588672346557967 | 0.456 | -0.184 | -0.029 |
| 2.591813939211557 | 0.456 | -0.186 | -0.026 |
| 2.594955531865147 | 0.456 | -0.187 | -0.023 |
| 2.598097124518736 | 0.456 | -0.188 | -0.02 |
| 2.601238717172326 | 0.456 | -0.19 | -0.017 |
| 2.604380309825915 | 0.456 | -0.191 | -0.014 |
| 2.607521902479505 | 0.457 | -0.192 | -0.01 |
| 2.610663495133095 | 0.457 | -0.194 | -0.007 |
| 2.613805087786684 | 0.457 | -0.195 | -0.004 |
| 2.616946680440274 | 0.457 | -0.196 | -0.001 |
| 2.620088273093863 | 0.457 | -0.197 | 0.002 |
| 2.623229865747452 | 0.457 | -0.198 | 0.005 |
| 2.626371458401042 | 0.457 | -0.199 | 0.008 |
| 2.629513051054632 | 0.457 | -0.2 | 0.012 |
| 2.632654643708222 | 0.457 | -0.201 | 0.015 |
| 2.635796236361811 | 0.457 | -0.202 | 0.018 |
| 2.638937829015401 | 0.457 | -0.203 | 0.021 |
| 2.642079421668991 | 0.457 | -0.204 | 0.024 |
| 2.64522101432258 | 0.457 | -0.205 | 0.027 |
| 2.64836260697617 | 0.457 | -0.206 | 0.03 |
| 2.651504199629759 | 0.457 | -0.207 | 0.033 |
| 2.654645792283349 | 0.457 | -0.208 | 0.036 |
| 2.657787384936938 | 0.457 | -0.209 | 0.039 |
| 2.660928977590528 | 0.457 | -0.209 | 0.042 |
| 2.664070570244118 | 0.457 | -0.21 | 0.045 |
| 2.667212162897707 | 0.457 | -0.211 | 0.048 |
| 2.670353755551297 | 0.457 | -0.212 | 0.051 |
| 2.673495348204887 | 0.457 | -0.212 | 0.054 |
| 2.676636940858476 | 0.457 | -0.213 | 0.057 |
| 2.679778533512066 | 0.457 | -0.214 | 0.059 |
| 2.682920126165655 | 0.457 | -0.214 | 0.062 |
| 2.686061718819245 | 0.457 | -0.215 | 0.065 |
| 2.689203311472835 | 0.457 | -0.216 | 0.068 |
| 2.692344904126424 | 0.457 | -0.216 | 0.07 |
| 2.695486496780014 | 0.457 | -0.217 | 0.073 |
| 2.698628089433603 | 0.457 | -0.217 | 0.075 |
| 2.701769682087193 | 0.457 | -0.218 | 0.078 |
| 2.704911274740782 | 0.457 | -0.218 | 0.08 |
| 2.708052867394372 | 0.457 | -0.219 | 0.083 |
| 2.711194460047962 | 0.457 | -0.219 | 0.085 |
| 2.714336052701551 | 0.457 | -0.22 | 0.088 |
| 2.717477645355141 | 0.457 | -0.22 | 0.09 |
| 2.720619238008731 | 0.457 | -0.22 | 0.092 |
| 2.72376083066232 | 0.457 | -0.221 | 0.094 |
| 2.72690242331591 | 0.457 | -0.221 | 0.097 |
| 2.730044015969499 | 0.457 | -0.222 | 0.099 |
| 2.733185608623089 | 0.457 | -0.222 | 0.101 |
| 2.736327201276678 | 0.457 | -0.222 | 0.103 |
| 2.739468793930268 | 0.457 | -0.223 | 0.105 |
| 2.742610386583858 | 0.457 | -0.223 | 0.107 |
| 2.745751979237447 | 0.457 | -0.223 | 0.109 |
| 2.748893571891036 | 0.457 | -0.223 | 0.11 |
| 2.752035164544627 | 0.457 | -0.224 | 0.112 |
| 2.755176757198216 | 0.457 | -0.224 | 0.114 |
| 2.758318349851806 | 0.457 | -0.224 | 0.116 |
| 2.761459942505395 | 0.457 | -0.225 | 0.117 |
| 2.764601535158985 | 0.457 | -0.225 | 0.119 |
| 2.767743127812574 | 0.457 | -0.225 | 0.12 |
| 2.770884720466164 | 0.457 | -0.225 | 0.122 |
| 2.774026313119754 | 0.457 | -0.225 | 0.123 |
| 2.777167905773343 | 0.457 | -0.226 | 0.125 |
| 2.780309498426932 | 0.457 | -0.226 | 0.126 |
| 2.783451091080522 | 0.457 | -0.226 | 0.127 |
| 2.786592683734112 | 0.457 | -0.226 | 0.129 |
| 2.789734276387701 | 0.457 | -0.226 | 0.13 |
| 2.792875869041291 | 0.457 | -0.226 | 0.131 |
| 2.796017461694881 | 0.457 | -0.226 | 0.132 |
| 2.79915905434847 | 0.457 | -0.227 | 0.133 |
| 2.80230064700206 | 0.457 | -0.227 | 0.134 |
| 2.80544223965565 | 0.457 | -0.227 | 0.135 |
| 2.808583832309239 | 0.457 | -0.227 | 0.136 |
| 2.811725424962829 | 0.457 | -0.227 | 0.137 |
| 2.814867017616419 | 0.457 | -0.227 | 0.138 |
| 2.818008610270008 | 0.457 | -0.227 | 0.139 |
| 2.821150202923598 | 0.457 | -0.227 | 0.14 |
| 2.824291795577187 | 0.457 | -0.227 | 0.14 |
| 2.827433388230777 | 0.457 | -0.228 | 0.141 |
| 2.830574980884366 | 0.457 | -0.228 | 0.142 |
| 2.833716573537956 | 0.457 | -0.228 | 0.142 |
| 2.836858166191546 | 0.457 | -0.228 | 0.143 |
| 2.839999758845135 | 0.457 | -0.228 | 0.144 |
| 2.843141351498725 | 0.457 | -0.228 | 0.144 |
| 2.846282944152314 | 0.457 | -0.228 | 0.145 |
| 2.849424536805904 | 0.457 | -0.228 | 0.145 |
| 2.852566129459494 | 0.457 | -0.228 | 0.146 |
| 2.855707722113083 | 0.457 | -0.228 | 0.146 |
| 2.858849314766673 | 0.457 | -0.228 | 0.147 |
| 2.861990907420262 | 0.457 | -0.228 | 0.147 |
| 2.865132500073852 | 0.457 | -0.228 | 0.147 |
| 2.868274092727442 | 0.457 | -0.228 | 0.148 |
| 2.871415685381031 | 0.457 | -0.228 | 0.148 |
| 2.874557278034621 | 0.457 | -0.228 | 0.149 |
| 2.87769887068821 | 0.457 | -0.228 | 0.149 |
| 2.8808404633418 | 0.457 | -0.228 | 0.149 |
| 2.88398205599539 | 0.457 | -0.228 | 0.149 |
| 2.88712364864898 | 0.457 | -0.228 | 0.15 |
| 2.890265241302569 | 0.457 | -0.228 | 0.15 |
| 2.893406833956158 | 0.457 | -0.228 | 0.15 |
| 2.896548426609748 | 0.457 | -0.228 | 0.15 |
| 2.899690019263338 | 0.457 | -0.228 | 0.15 |
| 2.902831611916927 | 0.457 | -0.228 | 0.151 |
| 2.905973204570517 | 0.457 | -0.228 | 0.151 |
| 2.909114797224106 | 0.457 | -0.228 | 0.151 |
| 2.912256389877696 | 0.457 | -0.228 | 0.151 |
| 2.915397982531286 | 0.457 | -0.228 | 0.151 |
| 2.918539575184875 | 0.457 | -0.228 | 0.151 |
| 2.921681167838465 | 0.457 | -0.228 | 0.151 |
| 2.924822760492054 | 0.457 | -0.229 | 0.151 |
| 2.927964353145644 | 0.457 | -0.229 | 0.152 |
| 2.931105945799234 | 0.457 | -0.229 | 0.152 |
| 2.934247538452823 | 0.457 | -0.229 | 0.152 |
| 2.937389131106413 | 0.457 | -0.229 | 0.152 |
| 2.940530723760002 | 0.457 | -0.229 | 0.152 |
| 2.943672316413592 | 0.457 | -0.229 | 0.152 |
| 2.946813909067182 | 0.457 | -0.229 | 0.152 |
| 2.949955501720771 | 0.457 | -0.229 | 0.152 |
| 2.953097094374361 | 0.457 | -0.229 | 0.152 |
| 2.95623868702795 | 0.457 | -0.229 | 0.152 |
| 2.95938027968154 | 0.457 | -0.229 | 0.152 |
| 2.96252187233513 | 0.457 | -0.229 | 0.152 |
| 2.965663464988719 | 0.457 | -0.229 | 0.152 |
| 2.968805057642309 | 0.457 | -0.229 | 0.152 |
| 2.971946650295898 | 0.457 | -0.229 | 0.152 |
| 2.975088242949488 | 0.457 | -0.229 | 0.152 |
| 2.978229835603078 | 0.457 | -0.229 | 0.152 |
| 2.981371428256667 | 0.457 | -0.229 | 0.152 |
| 2.984513020910257 | 0.457 | -0.229 | 0.152 |
| 2.987654613563846 | 0.457 | -0.229 | 0.152 |
| 2.990796206217436 | 0.457 | -0.229 | 0.152 |
| 2.993937798871025 | 0.457 | -0.229 | 0.152 |
| 2.997079391524615 | 0.457 | -0.229 | 0.152 |
| 3.000220984178205 | 0.457 | -0.229 | 0.152 |
| 3.003362576831794 | 0.457 | -0.229 | 0.152 |
| 3.006504169485384 | 0.457 | -0.229 | 0.152 |
| 3.009645762138974 | 0.457 | -0.229 | 0.152 |
| 3.012787354792563 | 0.457 | -0.229 | 0.152 |
| 3.015928947446153 | 0.457 | -0.229 | 0.152 |
| 3.019070540099742 | 0.457 | -0.229 | 0.152 |
| 3.022212132753332 | 0.457 | -0.229 | 0.152 |
| 3.025353725406922 | 0.457 | -0.229 | 0.152 |
| 3.028495318060511 | 0.457 | -0.229 | 0.152 |
| 3.031636910714101 | 0.457 | -0.229 | 0.152 |
| 3.03477850336769 | 0.457 | -0.229 | 0.152 |
| 3.03792009602128 | 0.457 | -0.229 | 0.152 |
| 3.04106168867487 | 0.457 | -0.229 | 0.152 |
| 3.04420328132846 | 0.457 | -0.229 | 0.152 |
| 3.047344873982049 | 0.457 | -0.229 | 0.152 |
| 3.050486466635638 | 0.457 | -0.229 | 0.152 |
| 3.053628059289228 | 0.457 | -0.229 | 0.152 |
| 3.056769651942818 | 0.457 | -0.229 | 0.152 |
| 3.059911244596407 | 0.457 | -0.229 | 0.152 |
| 3.063052837249997 | 0.457 | -0.229 | 0.152 |
| 3.066194429903586 | 0.457 | -0.229 | 0.152 |
| 3.069336022557176 | 0.457 | -0.229 | 0.152 |
| 3.072477615210766 | 0.457 | -0.229 | 0.152 |
| 3.075619207864355 | 0.457 | -0.229 | 0.152 |
| 3.078760800517945 | 0.457 | -0.229 | 0.152 |
| 3.081902393171534 | 0.457 | -0.229 | 0.152 |
| 3.085043985825124 | 0.457 | -0.229 | 0.152 |
| 3.088185578478713 | 0.457 | -0.229 | 0.152 |
| 3.091327171132303 | 0.457 | -0.229 | 0.152 |
| 3.094468763785893 | 0.457 | -0.229 | 0.152 |
| 3.097610356439482 | 0.457 | -0.229 | 0.152 |
| 3.100751949093072 | 0.457 | -0.229 | 0.152 |
| 3.103893541746661 | 0.457 | -0.229 | 0.152 |
| 3.107035134400251 | 0.457 | -0.229 | 0.152 |
| 3.110176727053841 | 0.457 | -0.229 | 0.152 |
| 3.11331831970743 | 0.457 | -0.229 | 0.152 |
| 3.11645991236102 | 0.457 | -0.229 | 0.152 |
| 3.11960150501461 | 0.457 | -0.229 | 0.152 |
| 3.122743097668199 | 0.457 | -0.229 | 0.152 |
| 3.125884690321789 | 0.457 | -0.229 | 0.152 |
| 3.129026282975378 | 0.457 | -0.229 | 0.152 |
| 3.132167875628968 | 0.457 | -0.229 | 0.152 |
| 3.135309468282557 | 0.457 | -0.229 | 0.152 |
| 3.138451060936147 | 0.457 | -0.229 | 0.152 |
| 3.141592653589737 | 0.457 | -0.229 | 0.152 |
| 3.144734246243326 | 0.457 | -0.229 | 0.152 |
| 3.147875838896916 | 0.457 | -0.229 | 0.152 |
| 3.151017431550505 | 0.457 | -0.229 | 0.152 |
| 3.154159024204095 | 0.457 | -0.229 | 0.152 |
| 3.157300616857685 | 0.457 | -0.229 | 0.152 |
| 3.160442209511274 | 0.457 | -0.229 | 0.152 |
| 3.163583802164864 | 0.457 | -0.229 | 0.152 |
| 3.166725394818453 | 0.457 | -0.229 | 0.152 |
| 3.169866987472043 | 0.457 | -0.229 | 0.152 |
| 3.173008580125633 | 0.457 | -0.229 | 0.152 |
| 3.176150172779222 | 0.457 | -0.229 | 0.152 |
| 3.179291765432812 | 0.457 | -0.229 | 0.152 |
| 3.182433358086401 | 0.457 | -0.229 | 0.152 |
| 3.185574950739991 | 0.457 | -0.229 | 0.152 |
| 3.188716543393581 | 0.457 | -0.229 | 0.152 |
| 3.19185813604717 | 0.457 | -0.229 | 0.152 |
| 3.19499972870076 | 0.457 | -0.229 | 0.152 |
| 3.198141321354349 | 0.457 | -0.229 | 0.152 |
| 3.20128291400794 | 0.457 | -0.229 | 0.152 |
| 3.204424506661528 | 0.457 | -0.229 | 0.152 |
| 3.207566099315118 | 0.457 | -0.229 | 0.152 |
| 3.210707691968708 | 0.457 | -0.229 | 0.152 |
| 3.213849284622297 | 0.457 | -0.229 | 0.152 |
| 3.216990877275887 | 0.457 | -0.229 | 0.152 |
| 3.220132469929476 | 0.457 | -0.229 | 0.152 |
| 3.223274062583066 | 0.457 | -0.229 | 0.152 |
| 3.226415655236656 | 0.457 | -0.229 | 0.152 |
| 3.229557247890245 | 0.457 | -0.229 | 0.152 |
| 3.232698840543835 | 0.457 | -0.229 | 0.152 |
| 3.235840433197425 | 0.457 | -0.229 | 0.152 |
| 3.238982025851014 | 0.457 | -0.229 | 0.152 |
| 3.242123618504604 | 0.457 | -0.229 | 0.152 |
| 3.245265211158193 | 0.457 | -0.229 | 0.152 |
| 3.248406803811783 | 0.457 | -0.229 | 0.152 |
| 3.251548396465373 | 0.457 | -0.229 | 0.152 |
| 3.254689989118962 | 0.457 | -0.229 | 0.152 |
| 3.257831581772551 | 0.457 | -0.229 | 0.152 |
| 3.260973174426141 | 0.457 | -0.229 | 0.152 |
| 3.26411476707973 | 0.457 | -0.229 | 0.152 |
| 3.267256359733321 | 0.457 | -0.229 | 0.152 |
| 3.27039795238691 | 0.457 | -0.229 | 0.152 |
| 3.2735395450405 | 0.457 | -0.229 | 0.152 |
| 3.276681137694089 | 0.457 | -0.229 | 0.152 |
| 3.279822730347679 | 0.457 | -0.229 | 0.152 |
| 3.282964323001269 | 0.457 | -0.229 | 0.152 |
| 3.286105915654858 | 0.457 | -0.229 | 0.152 |
| 3.289247508308448 | 0.457 | -0.229 | 0.152 |
| 3.292389100962037 | 0.457 | -0.229 | 0.152 |
| 3.295530693615627 | 0.457 | -0.229 | 0.152 |
| 3.298672286269217 | 0.457 | -0.229 | 0.152 |
| 3.301813878922806 | 0.457 | -0.229 | 0.152 |
| 3.304955471576396 | 0.457 | -0.229 | 0.152 |
| 3.308097064229985 | 0.457 | -0.229 | 0.152 |
| 3.311238656883575 | 0.457 | -0.229 | 0.152 |
| 3.314380249537165 | 0.457 | -0.229 | 0.152 |
| 3.317521842190754 | 0.457 | -0.229 | 0.152 |
| 3.320663434844344 | 0.457 | -0.229 | 0.152 |
| 3.323805027497933 | 0.457 | -0.229 | 0.152 |
| 3.326946620151523 | 0.457 | -0.229 | 0.152 |
| 3.330088212805113 | 0.457 | -0.229 | 0.152 |
| 3.333229805458702 | 0.457 | -0.229 | 0.152 |
| 3.336371398112292 | 0.457 | -0.229 | 0.152 |
| 3.339512990765881 | 0.457 | -0.229 | 0.152 |
| 3.342654583419471 | 0.457 | -0.229 | 0.152 |
| 3.345796176073061 | 0.457 | -0.229 | 0.152 |
| 3.34893776872665 | 0.457 | -0.229 | 0.152 |
| 3.35207936138024 | 0.457 | -0.229 | 0.152 |
| 3.355220954033829 | 0.457 | -0.229 | 0.152 |
| 3.358362546687419 | 0.457 | -0.229 | 0.151 |
| 3.361504139341009 | 0.457 | -0.228 | 0.151 |
| 3.364645731994598 | 0.457 | -0.228 | 0.151 |
| 3.367787324648188 | 0.457 | -0.228 | 0.151 |
| 3.370928917301777 | 0.457 | -0.228 | 0.151 |
| 3.374070509955367 | 0.457 | -0.228 | 0.151 |
| 3.377212102608956 | 0.457 | -0.228 | 0.151 |
| 3.380353695262546 | 0.457 | -0.228 | 0.151 |
| 3.383495287916136 | 0.457 | -0.228 | 0.15 |
| 3.386636880569725 | 0.457 | -0.228 | 0.15 |
| 3.389778473223315 | 0.457 | -0.228 | 0.15 |
| 3.392920065876904 | 0.457 | -0.228 | 0.15 |
| 3.396061658530494 | 0.457 | -0.228 | 0.15 |
| 3.399203251184084 | 0.457 | -0.228 | 0.149 |
| 3.402344843837673 | 0.457 | -0.228 | 0.149 |
| 3.405486436491263 | 0.457 | -0.228 | 0.149 |
| 3.408628029144852 | 0.457 | -0.228 | 0.149 |
| 3.411769621798442 | 0.457 | -0.228 | 0.148 |
| 3.414911214452032 | 0.457 | -0.228 | 0.148 |
| 3.418052807105621 | 0.457 | -0.228 | 0.147 |
| 3.421194399759211 | 0.457 | -0.228 | 0.147 |
| 3.4243359924128 | 0.457 | -0.228 | 0.147 |
| 3.42747758506639 | 0.457 | -0.228 | 0.146 |
| 3.43061917771998 | 0.457 | -0.228 | 0.146 |
| 3.433760770373569 | 0.457 | -0.228 | 0.145 |
| 3.436902363027159 | 0.457 | -0.228 | 0.145 |
| 3.440043955680748 | 0.457 | -0.228 | 0.144 |
| 3.443185548334338 | 0.457 | -0.228 | 0.144 |
| 3.446327140987927 | 0.457 | -0.228 | 0.143 |
| 3.449468733641517 | 0.457 | -0.228 | 0.142 |
| 3.452610326295107 | 0.457 | -0.228 | 0.142 |
| 3.455751918948696 | 0.457 | -0.228 | 0.141 |
| 3.458893511602286 | 0.457 | -0.227 | 0.14 |
| 3.462035104255876 | 0.457 | -0.227 | 0.14 |
| 3.465176696909465 | 0.457 | -0.227 | 0.139 |
| 3.468318289563055 | 0.457 | -0.227 | 0.138 |
| 3.471459882216644 | 0.457 | -0.227 | 0.137 |
| 3.474601474870234 | 0.457 | -0.227 | 0.136 |
| 3.477743067523824 | 0.457 | -0.227 | 0.135 |
| 3.480884660177413 | 0.457 | -0.227 | 0.134 |
| 3.484026252831002 | 0.457 | -0.227 | 0.133 |
| 3.487167845484592 | 0.457 | -0.226 | 0.132 |
| 3.490309438138182 | 0.457 | -0.226 | 0.131 |
| 3.493451030791772 | 0.457 | -0.226 | 0.13 |
| 3.496592623445361 | 0.457 | -0.226 | 0.129 |
| 3.499734216098951 | 0.457 | -0.226 | 0.127 |
| 3.50287580875254 | 0.457 | -0.226 | 0.126 |
| 3.50601740140613 | 0.457 | -0.226 | 0.125 |
| 3.50915899405972 | 0.457 | -0.225 | 0.123 |
| 3.512300586713309 | 0.457 | -0.225 | 0.122 |
| 3.515442179366899 | 0.457 | -0.225 | 0.12 |
| 3.518583772020488 | 0.457 | -0.225 | 0.119 |
| 3.521725364674078 | 0.457 | -0.225 | 0.117 |
| 3.524866957327668 | 0.457 | -0.224 | 0.116 |
| 3.528008549981257 | 0.457 | -0.224 | 0.114 |
| 3.531150142634847 | 0.457 | -0.224 | 0.112 |
| 3.534291735288436 | 0.457 | -0.223 | 0.11 |
| 3.537433327942026 | 0.457 | -0.223 | 0.109 |
| 3.540574920595616 | 0.457 | -0.223 | 0.107 |
| 3.543716513249205 | 0.457 | -0.223 | 0.105 |
| 3.546858105902795 | 0.457 | -0.222 | 0.103 |
| 3.549999698556384 | 0.457 | -0.222 | 0.101 |
| 3.553141291209974 | 0.457 | -0.222 | 0.099 |
| 3.556282883863564 | 0.457 | -0.221 | 0.097 |
| 3.559424476517153 | 0.457 | -0.221 | 0.094 |
| 3.562566069170743 | 0.457 | -0.22 | 0.092 |
| 3.565707661824332 | 0.457 | -0.22 | 0.09 |
| 3.568849254477922 | 0.457 | -0.22 | 0.088 |
| 3.571990847131511 | 0.457 | -0.219 | 0.085 |
| 3.575132439785101 | 0.457 | -0.219 | 0.083 |
| 3.578274032438691 | 0.457 | -0.218 | 0.08 |
| 3.58141562509228 | 0.457 | -0.218 | 0.078 |
| 3.58455721774587 | 0.457 | -0.217 | 0.075 |
| 3.58769881039946 | 0.457 | -0.217 | 0.073 |
| 3.590840403053049 | 0.457 | -0.216 | 0.07 |
| 3.593981995706639 | 0.457 | -0.216 | 0.068 |
| 3.597123588360228 | 0.457 | -0.215 | 0.065 |
| 3.600265181013818 | 0.457 | -0.214 | 0.062 |
| 3.603406773667407 | 0.457 | -0.214 | 0.059 |
| 3.606548366320997 | 0.457 | -0.213 | 0.057 |
| 3.609689958974587 | 0.457 | -0.212 | 0.054 |
| 3.612831551628176 | 0.457 | -0.212 | 0.051 |
| 3.615973144281766 | 0.457 | -0.211 | 0.048 |
| 3.619114736935355 | 0.457 | -0.21 | 0.045 |
| 3.622256329588945 | 0.457 | -0.209 | 0.042 |
| 3.625397922242534 | 0.457 | -0.209 | 0.039 |
| 3.628539514896124 | 0.457 | -0.208 | 0.036 |
| 3.631681107549714 | 0.457 | -0.207 | 0.033 |
| 3.634822700203303 | 0.457 | -0.206 | 0.03 |
| 3.637964292856893 | 0.457 | -0.205 | 0.027 |
| 3.641105885510483 | 0.457 | -0.204 | 0.024 |
| 3.644247478164072 | 0.457 | -0.203 | 0.021 |
| 3.647389070817662 | 0.457 | -0.202 | 0.018 |
| 3.650530663471251 | 0.457 | -0.201 | 0.015 |
| 3.653672256124841 | 0.457 | -0.2 | 0.012 |
| 3.656813848778431 | 0.457 | -0.199 | 0.008 |
| 3.65995544143202 | 0.457 | -0.198 | 0.005 |
| 3.66309703408561 | 0.457 | -0.197 | 0.002 |
| 3.666238626739199 | 0.457 | -0.196 | -0.001 |
| 3.66938021939279 | 0.457 | -0.195 | -0.004 |
| 3.672521812046378 | 0.457 | -0.194 | -0.007 |
| 3.675663404699968 | 0.457 | -0.192 | -0.01 |
| 3.678804997353558 | 0.456 | -0.191 | -0.014 |
| 3.681946590007147 | 0.456 | -0.19 | -0.017 |
| 3.685088182660737 | 0.456 | -0.188 | -0.02 |
| 3.688229775314326 | 0.456 | -0.187 | -0.023 |
| 3.691371367967916 | 0.456 | -0.186 | -0.026 |
| 3.694512960621506 | 0.456 | -0.184 | -0.029 |
| 3.697654553275095 | 0.456 | -0.183 | -0.032 |
| 3.700796145928685 | 0.456 | -0.181 | -0.035 |
| 3.703937738582274 | 0.456 | -0.18 | -0.038 |
| 3.707079331235864 | 0.456 | -0.178 | -0.041 |
| 3.710220923889454 | 0.456 | -0.177 | -0.044 |
| 3.713362516543043 | 0.456 | -0.175 | -0.047 |
| 3.716504109196633 | 0.456 | -0.173 | -0.05 |
| 3.719645701850223 | 0.456 | -0.172 | -0.053 |
| 3.722787294503812 | 0.456 | -0.17 | -0.056 |
| 3.725928887157402 | 0.456 | -0.168 | -0.058 |
| 3.729070479810991 | 0.456 | -0.167 | -0.061 |
| 3.732212072464581 | 0.456 | -0.165 | -0.064 |
| 3.735353665118171 | 0.456 | -0.163 | -0.067 |
| 3.73849525777176 | 0.456 | -0.161 | -0.069 |
| 3.74163685042535 | 0.456 | -0.159 | -0.072 |
| 3.744778443078939 | 0.456 | -0.157 | -0.075 |
| 3.747920035732529 | 0.456 | -0.155 | -0.077 |
| 3.751061628386119 | 0.455 | -0.153 | -0.08 |
| 3.754203221039708 | 0.455 | -0.151 | -0.082 |
| 3.757344813693298 | 0.455 | -0.149 | -0.085 |
| 3.760486406346887 | 0.455 | -0.147 | -0.087 |
| 3.763627999000477 | 0.455 | -0.145 | -0.089 |
| 3.766769591654067 | 0.455 | -0.143 | -0.091 |
| 3.769911184307656 | 0.455 | -0.141 | -0.094 |
| 3.773052776961246 | 0.455 | -0.138 | -0.096 |
| 3.776194369614835 | 0.455 | -0.136 | -0.098 |
| 3.779335962268425 | 0.455 | -0.134 | -0.1 |
| 3.782477554922014 | 0.455 | -0.131 | -0.102 |
| 3.785619147575604 | 0.455 | -0.129 | -0.104 |
| 3.788760740229193 | 0.455 | -0.127 | -0.106 |
| 3.791902332882783 | 0.454 | -0.124 | -0.108 |
| 3.795043925536373 | 0.454 | -0.122 | -0.11 |
| 3.798185518189962 | 0.454 | -0.119 | -0.112 |
| 3.801327110843552 | 0.454 | -0.117 | -0.113 |
| 3.804468703497142 | 0.454 | -0.114 | -0.115 |
| 3.807610296150731 | 0.454 | -0.112 | -0.117 |
| 3.810751888804321 | 0.454 | -0.109 | -0.118 |
| 3.813893481457911 | 0.454 | -0.107 | -0.12 |
| 3.8170350741115 | 0.454 | -0.104 | -0.121 |
| 3.82017666676509 | 0.453 | -0.101 | -0.123 |
| 3.823318259418679 | 0.453 | -0.099 | -0.124 |
| 3.826459852072269 | 0.453 | -0.096 | -0.126 |
| 3.829601444725859 | 0.453 | -0.093 | -0.127 |
| 3.832743037379448 | 0.453 | -0.09 | -0.128 |
| 3.835884630033038 | 0.453 | -0.088 | -0.129 |
| 3.839026222686627 | 0.453 | -0.085 | -0.131 |
| 3.842167815340217 | 0.453 | -0.082 | -0.132 |
| 3.845309407993807 | 0.452 | -0.079 | -0.133 |
| 3.848451000647396 | 0.452 | -0.076 | -0.134 |
| 3.851592593300986 | 0.452 | -0.073 | -0.135 |
| 3.854734185954575 | 0.452 | -0.071 | -0.136 |
| 3.857875778608165 | 0.452 | -0.068 | -0.137 |
| 3.861017371261755 | 0.452 | -0.065 | -0.138 |
| 3.864158963915344 | 0.451 | -0.062 | -0.139 |
| 3.867300556568933 | 0.451 | -0.059 | -0.139 |
| 3.870442149222523 | 0.451 | -0.056 | -0.14 |
| 3.873583741876112 | 0.451 | -0.053 | -0.141 |
| 3.876725334529703 | 0.451 | -0.05 | -0.142 |
| 3.879866927183292 | 0.451 | -0.047 | -0.142 |
| 3.883008519836882 | 0.45 | -0.044 | -0.143 |
| 3.886150112490471 | 0.45 | -0.041 | -0.144 |
| 3.889291705144061 | 0.45 | -0.037 | -0.144 |
| 3.892433297797651 | 0.45 | -0.034 | -0.145 |
| 3.89557489045124 | 0.449 | -0.031 | -0.145 |
| 3.89871648310483 | 0.449 | -0.028 | -0.146 |
| 3.901858075758419 | 0.449 | -0.025 | -0.146 |
| 3.904999668412009 | 0.449 | -0.022 | -0.147 |
| 3.908141261065598 | 0.449 | -0.019 | -0.147 |
| 3.911282853719188 | 0.448 | -0.016 | -0.147 |
| 3.914424446372778 | 0.448 | -0.013 | -0.148 |
| 3.917566039026367 | 0.448 | -0.009 | -0.148 |
| 3.920707631679957 | 0.448 | -0.006 | -0.148 |
| 3.923849224333547 | 0.447 | -0.003 | -0.149 |
| 3.926990816987136 | 0.447 | 0 | -0.149 |
| 3.930132409640726 | 0.447 | 0.003 | -0.149 |
| 3.933274002294315 | 0.446 | 0.006 | -0.15 |
| 3.936415594947905 | 0.446 | 0.009 | -0.15 |
| 3.939557187601495 | 0.446 | 0.013 | -0.15 |
| 3.942698780255084 | 0.446 | 0.016 | -0.15 |
| 3.945840372908674 | 0.445 | 0.019 | -0.15 |
| 3.948981965562263 | 0.445 | 0.022 | -0.151 |
| 3.952123558215853 | 0.445 | 0.025 | -0.151 |
| 3.955265150869442 | 0.444 | 0.028 | -0.151 |
| 3.958406743523032 | 0.444 | 0.031 | -0.151 |
| 3.961548336176622 | 0.444 | 0.034 | -0.151 |
| 3.964689928830211 | 0.443 | 0.037 | -0.151 |
| 3.967831521483801 | 0.443 | 0.041 | -0.151 |
| 3.97097311413739 | 0.442 | 0.044 | -0.151 |
| 3.97411470679098 | 0.442 | 0.047 | -0.152 |
| 3.97725629944457 | 0.442 | 0.05 | -0.152 |
| 3.98039789209816 | 0.441 | 0.053 | -0.152 |
| 3.983539484751749 | 0.441 | 0.056 | -0.152 |
| 3.986681077405338 | 0.441 | 0.059 | -0.152 |
| 3.989822670058928 | 0.44 | 0.062 | -0.152 |
| 3.992964262712517 | 0.44 | 0.065 | -0.152 |
| 3.996105855366107 | 0.439 | 0.068 | -0.152 |
| 3.999247448019697 | 0.439 | 0.071 | -0.152 |
| 4.002389040673287 | 0.438 | 0.073 | -0.152 |
| 4.005530633326877 | 0.438 | 0.076 | -0.152 |
| 4.008672225980466 | 0.437 | 0.079 | -0.152 |
| 4.011813818634056 | 0.437 | 0.082 | -0.152 |
| 4.014955411287645 | 0.436 | 0.085 | -0.152 |
| 4.018097003941234 | 0.436 | 0.088 | -0.152 |
| 4.021238596594824 | 0.435 | 0.09 | -0.152 |
| 4.024380189248414 | 0.435 | 0.093 | -0.152 |
| 4.027521781902004 | 0.434 | 0.096 | -0.152 |
| 4.030663374555593 | 0.434 | 0.099 | -0.152 |
| 4.033804967209183 | 0.433 | 0.101 | -0.152 |
| 4.036946559862773 | 0.433 | 0.104 | -0.152 |
| 4.040088152516362 | 0.432 | 0.107 | -0.152 |
| 4.043229745169951 | 0.432 | 0.109 | -0.152 |
| 4.046371337823541 | 0.431 | 0.112 | -0.152 |
| 4.049512930477131 | 0.431 | 0.114 | -0.152 |
| 4.05265452313072 | 0.43 | 0.117 | -0.152 |
| 4.05579611578431 | 0.429 | 0.119 | -0.152 |
| 4.0589377084379 | 0.429 | 0.122 | -0.152 |
| 4.062079301091489 | 0.428 | 0.124 | -0.152 |
| 4.065220893745079 | 0.427 | 0.127 | -0.152 |
| 4.068362486398668 | 0.427 | 0.129 | -0.152 |
| 4.071504079052258 | 0.426 | 0.131 | -0.152 |
| 4.074645671705848 | 0.425 | 0.134 | -0.152 |
| 4.077787264359437 | 0.425 | 0.136 | -0.152 |
| 4.080928857013027 | 0.424 | 0.138 | -0.152 |
| 4.084070449666616 | 0.423 | 0.141 | -0.152 |
| 4.087212042320206 | 0.423 | 0.143 | -0.152 |
| 4.090353634973795 | 0.422 | 0.145 | -0.152 |
| 4.093495227627385 | 0.421 | 0.147 | -0.152 |
| 4.096636820280975 | 0.42 | 0.149 | -0.152 |
| 4.099778412934564 | 0.42 | 0.151 | -0.152 |
| 4.102920005588154 | 0.419 | 0.153 | -0.152 |
| 4.106061598241744 | 0.418 | 0.155 | -0.152 |
| 4.109203190895333 | 0.417 | 0.157 | -0.152 |
| 4.112344783548923 | 0.416 | 0.159 | -0.152 |
| 4.115486376202512 | 0.416 | 0.161 | -0.152 |
| 4.118627968856102 | 0.415 | 0.163 | -0.152 |
| 4.121769561509692 | 0.414 | 0.165 | -0.152 |
| 4.124911154163281 | 0.413 | 0.167 | -0.152 |
| 4.128052746816871 | 0.412 | 0.168 | -0.152 |
| 4.13119433947046 | 0.411 | 0.17 | -0.152 |
| 4.13433593212405 | 0.41 | 0.172 | -0.152 |
| 4.13747752477764 | 0.409 | 0.173 | -0.152 |
| 4.14061911743123 | 0.409 | 0.175 | -0.152 |
| 4.143760710084818 | 0.408 | 0.177 | -0.152 |
| 4.146902302738408 | 0.407 | 0.178 | -0.152 |
| 4.150043895391998 | 0.406 | 0.18 | -0.152 |
| 4.153185488045588 | 0.405 | 0.181 | -0.152 |
| 4.156327080699177 | 0.404 | 0.183 | -0.152 |
| 4.159468673352766 | 0.403 | 0.184 | -0.152 |
| 4.162610266006356 | 0.402 | 0.186 | -0.152 |
| 4.165751858659946 | 0.401 | 0.187 | -0.152 |
| 4.168893451313535 | 0.4 | 0.188 | -0.152 |
| 4.172035043967125 | 0.399 | 0.19 | -0.152 |
| 4.175176636620715 | 0.397 | 0.191 | -0.152 |
| 4.178318229274304 | 0.396 | 0.192 | -0.152 |
| 4.181459821927894 | 0.395 | 0.194 | -0.152 |
| 4.184601414581484 | 0.394 | 0.195 | -0.152 |
| 4.187743007235073 | 0.393 | 0.196 | -0.152 |
| 4.190884599888663 | 0.392 | 0.197 | -0.152 |
| 4.194026192542252 | 0.391 | 0.198 | -0.152 |
| 4.197167785195842 | 0.39 | 0.199 | -0.152 |
| 4.200309377849432 | 0.388 | 0.2 | -0.152 |
| 4.203450970503021 | 0.387 | 0.201 | -0.152 |
| 4.206592563156611 | 0.386 | 0.202 | -0.152 |
| 4.2097341558102 | 0.385 | 0.203 | -0.152 |
| 4.21287574846379 | 0.383 | 0.204 | -0.152 |
| 4.21601734111738 | 0.382 | 0.205 | -0.152 |
| 4.21915893377097 | 0.381 | 0.206 | -0.152 |
| 4.222300526424559 | 0.38 | 0.207 | -0.152 |
| 4.225442119078148 | 0.378 | 0.208 | -0.152 |
| 4.228583711731738 | 0.377 | 0.209 | -0.152 |
| 4.231725304385327 | 0.376 | 0.209 | -0.152 |
| 4.234866897038917 | 0.374 | 0.21 | -0.152 |
| 4.238008489692506 | 0.373 | 0.211 | -0.152 |
| 4.241150082346096 | 0.371 | 0.212 | -0.152 |
| 4.244291674999685 | 0.37 | 0.212 | -0.152 |
| 4.247433267653276 | 0.369 | 0.213 | -0.152 |
| 4.250574860306865 | 0.367 | 0.214 | -0.152 |
| 4.253716452960455 | 0.366 | 0.214 | -0.152 |
| 4.256858045614044 | 0.364 | 0.215 | -0.152 |
| 4.259999638267634 | 0.363 | 0.216 | -0.152 |
| 4.263141230921224 | 0.361 | 0.216 | -0.152 |
| 4.266282823574813 | 0.36 | 0.217 | -0.152 |
| 4.269424416228403 | 0.358 | 0.217 | -0.152 |
| 4.272566008881992 | 0.357 | 0.218 | -0.152 |
| 4.275707601535582 | 0.355 | 0.218 | -0.152 |
| 4.27884919418917 | 0.353 | 0.219 | -0.152 |
| 4.28199078684276 | 0.352 | 0.219 | -0.152 |
| 4.285132379496351 | 0.35 | 0.22 | -0.152 |
| 4.28827397214994 | 0.349 | 0.22 | -0.152 |
| 4.29141556480353 | 0.347 | 0.22 | -0.152 |
| 4.294557157457119 | 0.345 | 0.221 | -0.152 |
| 4.29769875011071 | 0.344 | 0.221 | -0.152 |
| 4.300840342764299 | 0.342 | 0.222 | -0.152 |
| 4.303981935417888 | 0.34 | 0.222 | -0.152 |
| 4.307123528071478 | 0.338 | 0.222 | -0.152 |
| 4.310265120725067 | 0.337 | 0.223 | -0.152 |
| 4.313406713378657 | 0.335 | 0.223 | -0.152 |
| 4.316548306032247 | 0.333 | 0.223 | -0.152 |
| 4.319689898685836 | 0.331 | 0.223 | -0.152 |
| 4.322831491339426 | 0.33 | 0.224 | -0.152 |
| 4.325973083993015 | 0.328 | 0.224 | -0.152 |
| 4.329114676646605 | 0.326 | 0.224 | -0.152 |
| 4.332256269300195 | 0.324 | 0.225 | -0.152 |
| 4.335397861953784 | 0.322 | 0.225 | -0.152 |
| 4.338539454607374 | 0.32 | 0.225 | -0.152 |
| 4.341681047260963 | 0.318 | 0.225 | -0.152 |
| 4.344822639914553 | 0.316 | 0.225 | -0.152 |
| 4.347964232568143 | 0.314 | 0.226 | -0.152 |
| 4.351105825221732 | 0.313 | 0.226 | -0.152 |
| 4.354247417875322 | 0.311 | 0.226 | -0.152 |
| 4.357389010528911 | 0.309 | 0.226 | -0.152 |
| 4.360530603182501 | 0.307 | 0.226 | -0.152 |
| 4.36367219583609 | 0.305 | 0.226 | -0.152 |
| 4.36681378848968 | 0.302 | 0.226 | -0.152 |
| 4.36995538114327 | 0.3 | 0.227 | -0.152 |
| 4.373096973796859 | 0.298 | 0.227 | -0.152 |
| 4.376238566450449 | 0.296 | 0.227 | -0.152 |
| 4.379380159104038 | 0.294 | 0.227 | -0.152 |
| 4.382521751757628 | 0.292 | 0.227 | -0.152 |
| 4.385663344411217 | 0.29 | 0.227 | -0.152 |
| 4.388804937064807 | 0.288 | 0.227 | -0.152 |
| 4.391946529718397 | 0.286 | 0.227 | -0.152 |
| 4.395088122371987 | 0.283 | 0.227 | -0.152 |
| 4.398229715025576 | 0.281 | 0.228 | -0.152 |
| 4.401371307679165 | 0.279 | 0.228 | -0.152 |
| 4.404512900332755 | 0.277 | 0.228 | -0.152 |
| 4.407654492986345 | 0.274 | 0.228 | -0.151 |
| 4.410796085639934 | 0.272 | 0.228 | -0.151 |
| 4.413937678293524 | 0.27 | 0.228 | -0.151 |
| 4.417079270947114 | 0.268 | 0.228 | -0.151 |
| 4.420220863600703 | 0.265 | 0.228 | -0.151 |
| 4.423362456254293 | 0.263 | 0.228 | -0.151 |
| 4.426504048907883 | 0.261 | 0.228 | -0.151 |
| 4.429645641561472 | 0.258 | 0.228 | -0.15 |
| 4.432787234215062 | 0.256 | 0.228 | -0.15 |
| 4.435928826868651 | 0.254 | 0.228 | -0.15 |
| 4.43907041952224 | 0.251 | 0.228 | -0.15 |
| 4.44221201217583 | 0.249 | 0.228 | -0.15 |
| 4.44535360482942 | 0.246 | 0.228 | -0.149 |
| 4.44849519748301 | 0.244 | 0.228 | -0.149 |
| 4.4516367901366 | 0.241 | 0.228 | -0.149 |
| 4.454778382790188 | 0.239 | 0.228 | -0.149 |
| 4.457919975443779 | 0.236 | 0.228 | -0.148 |
| 4.461061568097368 | 0.234 | 0.228 | -0.148 |
| 4.464203160750958 | 0.231 | 0.228 | -0.148 |
| 4.467344753404547 | 0.229 | 0.228 | -0.147 |
| 4.470486346058137 | 0.226 | 0.228 | -0.147 |
| 4.473627938711726 | 0.224 | 0.228 | -0.146 |
| 4.476769531365316 | 0.221 | 0.228 | -0.146 |
| 4.479911124018905 | 0.219 | 0.228 | -0.145 |
| 4.483052716672495 | 0.216 | 0.228 | -0.145 |
| 4.486194309326085 | 0.213 | 0.228 | -0.144 |
| 4.489335901979674 | 0.211 | 0.228 | -0.144 |
| 4.492477494633264 | 0.208 | 0.228 | -0.143 |
| 4.495619087286854 | 0.205 | 0.229 | -0.143 |
| 4.498760679940443 | 0.203 | 0.229 | -0.142 |
| 4.501902272594033 | 0.2 | 0.229 | -0.141 |
| 4.505043865247622 | 0.197 | 0.229 | -0.141 |
| 4.508185457901212 | 0.195 | 0.229 | -0.14 |
| 4.511327050554801 | 0.192 | 0.229 | -0.139 |
| 4.514468643208391 | 0.189 | 0.229 | -0.138 |
| 4.517610235861981 | 0.186 | 0.229 | -0.137 |
| 4.520751828515571 | 0.184 | 0.229 | -0.136 |
| 4.52389342116916 | 0.181 | 0.229 | -0.136 |
| 4.52703501382275 | 0.178 | 0.229 | -0.135 |
| 4.530176606476339 | 0.175 | 0.229 | -0.134 |
| 4.533318199129928 | 0.173 | 0.229 | -0.132 |
| 4.536459791783518 | 0.17 | 0.229 | -0.131 |
| 4.539601384437108 | 0.167 | 0.229 | -0.13 |
| 4.542742977090698 | 0.164 | 0.229 | -0.129 |
| 4.545884569744287 | 0.161 | 0.229 | -0.128 |
| 4.549026162397876 | 0.158 | 0.229 | -0.127 |
| 4.552167755051466 | 0.156 | 0.229 | -0.125 |
| 4.555309347705056 | 0.153 | 0.229 | -0.124 |
| 4.558450940358646 | 0.15 | 0.229 | -0.122 |
| 4.561592533012235 | 0.147 | 0.229 | -0.121 |
| 4.564734125665825 | 0.144 | 0.229 | -0.119 |
| 4.567875718319415 | 0.141 | 0.229 | -0.118 |
| 4.571017310973004 | 0.138 | 0.229 | -0.116 |
| 4.574158903626594 | 0.135 | 0.229 | -0.115 |
| 4.577300496280183 | 0.132 | 0.229 | -0.113 |
| 4.580442088933772 | 0.129 | 0.229 | -0.111 |
| 4.583583681587362 | 0.126 | 0.229 | -0.109 |
| 4.586725274240952 | 0.123 | 0.229 | -0.107 |
| 4.589866866894542 | 0.12 | 0.229 | -0.105 |
| 4.593008459548131 | 0.117 | 0.229 | -0.104 |
| 4.596150052201721 | 0.114 | 0.229 | -0.102 |
| 4.59929164485531 | 0.111 | 0.229 | -0.099 |
| 4.6024332375089 | 0.108 | 0.229 | -0.097 |
| 4.60557483016249 | 0.105 | 0.229 | -0.095 |
| 4.608716422816079 | 0.102 | 0.229 | -0.093 |
| 4.611858015469668 | 0.099 | 0.229 | -0.091 |
| 4.614999608123258 | 0.096 | 0.229 | -0.088 |
| 4.618141200776848 | 0.093 | 0.229 | -0.086 |
| 4.621282793430437 | 0.09 | 0.229 | -0.084 |
| 4.624424386084027 | 0.087 | 0.229 | -0.081 |
| 4.627565978737617 | 0.084 | 0.229 | -0.079 |
| 4.630707571391206 | 0.081 | 0.229 | -0.076 |
| 4.633849164044795 | 0.078 | 0.229 | -0.074 |
| 4.636990756698386 | 0.075 | 0.229 | -0.071 |
| 4.640132349351975 | 0.072 | 0.229 | -0.068 |
| 4.643273942005564 | 0.069 | 0.229 | -0.066 |
| 4.646415534659154 | 0.066 | 0.229 | -0.063 |
| 4.649557127312744 | 0.063 | 0.229 | -0.06 |
| 4.652698719966334 | 0.059 | 0.229 | -0.058 |
| 4.655840312619923 | 0.056 | 0.229 | -0.055 |
| 4.658981905273513 | 0.053 | 0.229 | -0.052 |
| 4.662123497927102 | 0.05 | 0.229 | -0.049 |
| 4.665265090580692 | 0.047 | 0.229 | -0.046 |
| 4.668406683234282 | 0.044 | 0.229 | -0.043 |
| 4.671548275887871 | 0.041 | 0.229 | -0.04 |
| 4.674689868541461 | 0.038 | 0.229 | -0.037 |
| 4.67783146119505 | 0.035 | 0.229 | -0.034 |
| 4.68097305384864 | 0.031 | 0.229 | -0.031 |
| 4.68411464650223 | 0.028 | 0.229 | -0.028 |
| 4.687256239155819 | 0.025 | 0.229 | -0.025 |
| 4.690397831809409 | 0.022 | 0.229 | -0.022 |
| 4.693539424462998 | 0.019 | 0.229 | -0.019 |
| 4.696681017116588 | 0.016 | 0.229 | -0.016 |
| 4.699822609770177 | 0.013 | 0.229 | -0.013 |
| 4.702964202423767 | 0.009 | 0.229 | -0.009 |
| 4.706105795077356 | 0.006 | 0.229 | -0.006 |
| 4.709247387730946 | 0.003 | 0.229 | -0.003 |
| 4.712388980384535 | 0 | 0.229 | 0 |
| 4.715530573038126 | -0.003 | 0.229 | 0.003 |
| 4.718672165691715 | -0.006 | 0.229 | 0.006 |
| 4.721813758345305 | -0.009 | 0.229 | 0.009 |
| 4.724955350998894 | -0.013 | 0.229 | 0.013 |
| 4.728096943652484 | -0.016 | 0.229 | 0.016 |
| 4.731238536306074 | -0.019 | 0.229 | 0.019 |
| 4.734380128959663 | -0.022 | 0.229 | 0.022 |
| 4.737521721613253 | -0.025 | 0.229 | 0.025 |
| 4.740663314266842 | -0.028 | 0.229 | 0.028 |
| 4.743804906920432 | -0.031 | 0.229 | 0.031 |
| 4.74694649957402 | -0.035 | 0.229 | 0.034 |
| 4.750088092227611 | -0.038 | 0.229 | 0.037 |
| 4.7532296848812 | -0.041 | 0.229 | 0.04 |
| 4.75637127753479 | -0.044 | 0.229 | 0.043 |
| 4.75951287018838 | -0.047 | 0.229 | 0.046 |
| 4.76265446284197 | -0.05 | 0.229 | 0.049 |
| 4.765796055495559 | -0.053 | 0.229 | 0.052 |
| 4.768937648149149 | -0.056 | 0.229 | 0.055 |
| 4.772079240802738 | -0.059 | 0.229 | 0.058 |
| 4.775220833456327 | -0.063 | 0.229 | 0.06 |
| 4.778362426109917 | -0.066 | 0.229 | 0.063 |
| 4.781504018763507 | -0.069 | 0.229 | 0.066 |
| 4.784645611417097 | -0.072 | 0.229 | 0.068 |
| 4.787787204070686 | -0.075 | 0.229 | 0.071 |
| 4.790928796724275 | -0.078 | 0.229 | 0.074 |
| 4.794070389377865 | -0.081 | 0.229 | 0.076 |
| 4.797211982031455 | -0.084 | 0.229 | 0.079 |
| 4.800353574685045 | -0.087 | 0.229 | 0.081 |
| 4.803495167338634 | -0.09 | 0.229 | 0.084 |
| 4.806636759992224 | -0.093 | 0.229 | 0.086 |
| 4.809778352645814 | -0.096 | 0.229 | 0.088 |
| 4.812919945299403 | -0.099 | 0.229 | 0.091 |
| 4.816061537952993 | -0.102 | 0.229 | 0.093 |
| 4.819203130606582 | -0.105 | 0.229 | 0.095 |
| 4.822344723260172 | -0.108 | 0.229 | 0.097 |
| 4.825486315913761 | -0.111 | 0.229 | 0.099 |
| 4.828627908567351 | -0.114 | 0.229 | 0.102 |
| 4.83176950122094 | -0.117 | 0.229 | 0.104 |
| 4.83491109387453 | -0.12 | 0.229 | 0.105 |
| 4.83805268652812 | -0.123 | 0.229 | 0.107 |
| 4.841194279181709 | -0.126 | 0.229 | 0.109 |
| 4.844335871835299 | -0.129 | 0.229 | 0.111 |
| 4.847477464488889 | -0.132 | 0.229 | 0.113 |
| 4.850619057142478 | -0.135 | 0.229 | 0.115 |
| 4.853760649796068 | -0.138 | 0.229 | 0.116 |
| 4.856902242449657 | -0.141 | 0.229 | 0.118 |
| 4.860043835103247 | -0.144 | 0.229 | 0.119 |
| 4.863185427756837 | -0.147 | 0.229 | 0.121 |
| 4.866327020410426 | -0.15 | 0.229 | 0.122 |
| 4.869468613064015 | -0.153 | 0.229 | 0.124 |
| 4.872610205717605 | -0.156 | 0.229 | 0.125 |
| 4.875751798371195 | -0.158 | 0.229 | 0.127 |
| 4.878893391024784 | -0.161 | 0.229 | 0.128 |
| 4.882034983678374 | -0.164 | 0.229 | 0.129 |
| 4.885176576331964 | -0.167 | 0.229 | 0.13 |
| 4.888318168985553 | -0.17 | 0.229 | 0.131 |
| 4.891459761639143 | -0.173 | 0.229 | 0.132 |
| 4.894601354292733 | -0.175 | 0.229 | 0.134 |
| 4.897742946946322 | -0.178 | 0.229 | 0.135 |
| 4.900884539599912 | -0.181 | 0.229 | 0.136 |
| 4.904026132253501 | -0.184 | 0.229 | 0.136 |
| 4.907167724907091 | -0.186 | 0.229 | 0.137 |
| 4.91030931756068 | -0.189 | 0.229 | 0.138 |
| 4.91345091021427 | -0.192 | 0.229 | 0.139 |
| 4.91659250286786 | -0.195 | 0.229 | 0.14 |
| 4.91973409552145 | -0.197 | 0.229 | 0.141 |
| 4.922875688175039 | -0.2 | 0.229 | 0.141 |
| 4.926017280828628 | -0.203 | 0.229 | 0.142 |
| 4.929158873482218 | -0.205 | 0.229 | 0.143 |
| 4.932300466135808 | -0.208 | 0.228 | 0.143 |
| 4.935442058789397 | -0.211 | 0.228 | 0.144 |
| 4.938583651442987 | -0.213 | 0.228 | 0.144 |
| 4.941725244096576 | -0.216 | 0.228 | 0.145 |
| 4.944866836750166 | -0.219 | 0.228 | 0.145 |
| 4.948008429403755 | -0.221 | 0.228 | 0.146 |
| 4.951150022057345 | -0.224 | 0.228 | 0.146 |
| 4.954291614710935 | -0.226 | 0.228 | 0.147 |
| 4.957433207364524 | -0.229 | 0.228 | 0.147 |
| 4.960574800018114 | -0.231 | 0.228 | 0.148 |
| 4.963716392671704 | -0.234 | 0.228 | 0.148 |
| 4.966857985325293 | -0.236 | 0.228 | 0.148 |
| 4.969999577978883 | -0.239 | 0.228 | 0.149 |
| 4.973141170632472 | -0.241 | 0.228 | 0.149 |
| 4.976282763286062 | -0.244 | 0.228 | 0.149 |
| 4.979424355939651 | -0.246 | 0.228 | 0.149 |
| 4.982565948593241 | -0.249 | 0.228 | 0.15 |
| 4.985707541246831 | -0.251 | 0.228 | 0.15 |
| 4.98884913390042 | -0.254 | 0.228 | 0.15 |
| 4.99199072655401 | -0.256 | 0.228 | 0.15 |
| 4.9951323192076 | -0.258 | 0.228 | 0.15 |
| 4.99827391186119 | -0.261 | 0.228 | 0.151 |
| 5.00141550451478 | -0.263 | 0.228 | 0.151 |
| 5.004557097168369 | -0.265 | 0.228 | 0.151 |
| 5.007698689821958 | -0.268 | 0.228 | 0.151 |
| 5.010840282475548 | -0.27 | 0.228 | 0.151 |
| 5.013981875129137 | -0.272 | 0.228 | 0.151 |
| 5.017123467782727 | -0.274 | 0.228 | 0.151 |
| 5.020265060436317 | -0.277 | 0.228 | 0.152 |
| 5.023406653089906 | -0.279 | 0.228 | 0.152 |
| 5.026548245743496 | -0.281 | 0.228 | 0.152 |
| 5.029689838397085 | -0.283 | 0.227 | 0.152 |
| 5.032831431050674 | -0.286 | 0.227 | 0.152 |
| 5.035973023704264 | -0.288 | 0.227 | 0.152 |
| 5.039114616357854 | -0.29 | 0.227 | 0.152 |
| 5.042256209011444 | -0.292 | 0.227 | 0.152 |
| 5.045397801665033 | -0.294 | 0.227 | 0.152 |
| 5.048539394318622 | -0.296 | 0.227 | 0.152 |
| 5.051680986972213 | -0.298 | 0.227 | 0.152 |
| 5.054822579625802 | -0.3 | 0.227 | 0.152 |
| 5.057964172279392 | -0.302 | 0.226 | 0.152 |
| 5.061105764932981 | -0.305 | 0.226 | 0.152 |
| 5.064247357586571 | -0.307 | 0.226 | 0.152 |
| 5.067388950240161 | -0.309 | 0.226 | 0.152 |
| 5.07053054289375 | -0.311 | 0.226 | 0.152 |
| 5.07367213554734 | -0.313 | 0.226 | 0.152 |
| 5.07681372820093 | -0.314 | 0.226 | 0.152 |
| 5.079955320854519 | -0.316 | 0.225 | 0.152 |
| 5.083096913508108 | -0.318 | 0.225 | 0.152 |
| 5.086238506161698 | -0.32 | 0.225 | 0.152 |
| 5.089380098815288 | -0.322 | 0.225 | 0.152 |
| 5.092521691468877 | -0.324 | 0.225 | 0.152 |
| 5.095663284122466 | -0.326 | 0.224 | 0.152 |
| 5.098804876776057 | -0.328 | 0.224 | 0.152 |
| 5.101946469429646 | -0.33 | 0.224 | 0.152 |
| 5.105088062083236 | -0.331 | 0.223 | 0.152 |
| 5.108229654736825 | -0.333 | 0.223 | 0.152 |
| 5.111371247390415 | -0.335 | 0.223 | 0.152 |
| 5.114512840044005 | -0.337 | 0.223 | 0.152 |
| 5.117654432697594 | -0.338 | 0.222 | 0.152 |
| 5.120796025351184 | -0.34 | 0.222 | 0.152 |
| 5.123937618004773 | -0.342 | 0.222 | 0.152 |
| 5.127079210658363 | -0.344 | 0.221 | 0.152 |
| 5.130220803311953 | -0.345 | 0.221 | 0.152 |
| 5.133362395965542 | -0.347 | 0.22 | 0.152 |
| 5.136503988619131 | -0.349 | 0.22 | 0.152 |
| 5.13964558127272 | -0.35 | 0.22 | 0.152 |
| 5.142787173926311 | -0.352 | 0.219 | 0.152 |
| 5.1459287665799 | -0.353 | 0.219 | 0.152 |
| 5.14907035923349 | -0.355 | 0.218 | 0.152 |
| 5.15221195188708 | -0.357 | 0.218 | 0.152 |
| 5.15535354454067 | -0.358 | 0.217 | 0.152 |
| 5.158495137194259 | -0.36 | 0.217 | 0.152 |
| 5.161636729847848 | -0.361 | 0.216 | 0.152 |
| 5.164778322501438 | -0.363 | 0.216 | 0.152 |
| 5.167919915155028 | -0.364 | 0.215 | 0.152 |
| 5.171061507808617 | -0.366 | 0.214 | 0.152 |
| 5.174203100462206 | -0.367 | 0.214 | 0.152 |
| 5.177344693115796 | -0.369 | 0.213 | 0.152 |
| 5.180486285769386 | -0.37 | 0.212 | 0.152 |
| 5.183627878422976 | -0.371 | 0.212 | 0.152 |
| 5.186769471076565 | -0.373 | 0.211 | 0.152 |
| 5.189911063730155 | -0.374 | 0.21 | 0.152 |
| 5.193052656383744 | -0.376 | 0.209 | 0.152 |
| 5.196194249037334 | -0.377 | 0.209 | 0.152 |
| 5.199335841690924 | -0.378 | 0.208 | 0.152 |
| 5.202477434344513 | -0.38 | 0.207 | 0.152 |
| 5.205619026998103 | -0.381 | 0.206 | 0.152 |
| 5.208760619651692 | -0.382 | 0.205 | 0.152 |
| 5.211902212305282 | -0.383 | 0.204 | 0.152 |
| 5.215043804958871 | -0.385 | 0.203 | 0.152 |
| 5.218185397612461 | -0.386 | 0.202 | 0.152 |
| 5.221326990266051 | -0.387 | 0.201 | 0.152 |
| 5.22446858291964 | -0.388 | 0.2 | 0.152 |
| 5.22761017557323 | -0.39 | 0.199 | 0.152 |
| 5.23075176822682 | -0.391 | 0.198 | 0.152 |
| 5.23389336088041 | -0.392 | 0.197 | 0.152 |
| 5.237034953533999 | -0.393 | 0.196 | 0.152 |
| 5.240176546187588 | -0.394 | 0.195 | 0.152 |
| 5.243318138841178 | -0.395 | 0.194 | 0.152 |
| 5.246459731494767 | -0.396 | 0.192 | 0.152 |
| 5.249601324148357 | -0.397 | 0.191 | 0.152 |
| 5.252742916801947 | -0.399 | 0.19 | 0.152 |
| 5.255884509455536 | -0.4 | 0.188 | 0.152 |
| 5.259026102109125 | -0.401 | 0.187 | 0.152 |
| 5.262167694762715 | -0.402 | 0.186 | 0.152 |
| 5.265309287416305 | -0.403 | 0.184 | 0.152 |
| 5.268450880069895 | -0.404 | 0.183 | 0.152 |
| 5.271592472723484 | -0.405 | 0.181 | 0.152 |
| 5.274734065377074 | -0.406 | 0.18 | 0.152 |
| 5.277875658030664 | -0.407 | 0.178 | 0.152 |
| 5.281017250684253 | -0.408 | 0.177 | 0.152 |
| 5.284158843337843 | -0.409 | 0.175 | 0.152 |
| 5.287300435991432 | -0.409 | 0.173 | 0.152 |
| 5.290442028645022 | -0.41 | 0.172 | 0.152 |
| 5.293583621298612 | -0.411 | 0.17 | 0.152 |
| 5.296725213952201 | -0.412 | 0.168 | 0.152 |
| 5.299866806605791 | -0.413 | 0.167 | 0.152 |
| 5.30300839925938 | -0.414 | 0.165 | 0.152 |
| 5.30614999191297 | -0.415 | 0.163 | 0.152 |
| 5.30929158456656 | -0.416 | 0.161 | 0.152 |
| 5.312433177220149 | -0.416 | 0.159 | 0.152 |
| 5.315574769873739 | -0.417 | 0.157 | 0.152 |
| 5.318716362527328 | -0.418 | 0.155 | 0.152 |
| 5.321857955180918 | -0.419 | 0.153 | 0.152 |
| 5.324999547834508 | -0.42 | 0.151 | 0.152 |
| 5.328141140488097 | -0.42 | 0.149 | 0.152 |
| 5.331282733141686 | -0.421 | 0.147 | 0.152 |
| 5.334424325795276 | -0.422 | 0.145 | 0.152 |
| 5.337565918448866 | -0.423 | 0.143 | 0.152 |
| 5.340707511102456 | -0.423 | 0.141 | 0.152 |
| 5.343849103756045 | -0.424 | 0.138 | 0.152 |
| 5.346990696409634 | -0.425 | 0.136 | 0.152 |
| 5.350132289063224 | -0.425 | 0.134 | 0.152 |
| 5.353273881716814 | -0.426 | 0.131 | 0.152 |
| 5.356415474370403 | -0.427 | 0.129 | 0.152 |
| 5.359557067023993 | -0.427 | 0.127 | 0.152 |
| 5.362698659677583 | -0.428 | 0.124 | 0.152 |
| 5.365840252331172 | -0.429 | 0.122 | 0.152 |
| 5.368981844984762 | -0.429 | 0.119 | 0.152 |
| 5.372123437638351 | -0.43 | 0.117 | 0.152 |
| 5.375265030291941 | -0.431 | 0.114 | 0.152 |
| 5.378406622945531 | -0.431 | 0.112 | 0.152 |
| 5.38154821559912 | -0.432 | 0.109 | 0.152 |
| 5.38468980825271 | -0.432 | 0.107 | 0.152 |
| 5.387831400906299 | -0.433 | 0.104 | 0.152 |
| 5.39097299355989 | -0.433 | 0.101 | 0.152 |
| 5.394114586213479 | -0.434 | 0.099 | 0.152 |
| 5.397256178867068 | -0.434 | 0.096 | 0.152 |
| 5.400397771520657 | -0.435 | 0.093 | 0.152 |
| 5.403539364174247 | -0.435 | 0.09 | 0.152 |
| 5.406680956827837 | -0.436 | 0.088 | 0.152 |
| 5.409822549481426 | -0.436 | 0.085 | 0.152 |
| 5.412964142135016 | -0.437 | 0.082 | 0.152 |
| 5.416105734788605 | -0.437 | 0.079 | 0.152 |
| 5.419247327442195 | -0.438 | 0.076 | 0.152 |
| 5.422388920095785 | -0.438 | 0.073 | 0.152 |
| 5.425530512749375 | -0.439 | 0.071 | 0.152 |
| 5.428672105402964 | -0.439 | 0.068 | 0.152 |
| 5.431813698056554 | -0.44 | 0.065 | 0.152 |
| 5.434955290710143 | -0.44 | 0.062 | 0.152 |
| 5.438096883363733 | -0.441 | 0.059 | 0.152 |
| 5.441238476017322 | -0.441 | 0.056 | 0.152 |
| 5.444380068670912 | -0.441 | 0.053 | 0.152 |
| 5.447521661324502 | -0.442 | 0.05 | 0.152 |
| 5.450663253978091 | -0.442 | 0.047 | 0.152 |
| 5.453804846631681 | -0.442 | 0.044 | 0.151 |
| 5.456946439285271 | -0.443 | 0.041 | 0.151 |
| 5.46008803193886 | -0.443 | 0.037 | 0.151 |
| 5.46322962459245 | -0.444 | 0.034 | 0.151 |
| 5.466371217246039 | -0.444 | 0.031 | 0.151 |
| 5.46951280989963 | -0.444 | 0.028 | 0.151 |
| 5.472654402553218 | -0.445 | 0.025 | 0.151 |
| 5.475795995206808 | -0.445 | 0.022 | 0.151 |
| 5.478937587860398 | -0.445 | 0.019 | 0.15 |
| 5.482079180513987 | -0.446 | 0.016 | 0.15 |
| 5.485220773167577 | -0.446 | 0.013 | 0.15 |
| 5.488362365821166 | -0.446 | 0.009 | 0.15 |
| 5.491503958474756 | -0.446 | 0.006 | 0.15 |
| 5.494645551128346 | -0.447 | 0.003 | 0.149 |
| 5.497787143781935 | -0.447 | 0 | 0.149 |
| 5.500928736435525 | -0.447 | -0.003 | 0.149 |
| 5.504070329089115 | -0.448 | -0.006 | 0.148 |
| 5.507211921742704 | -0.448 | -0.009 | 0.148 |
| 5.510353514396294 | -0.448 | -0.013 | 0.148 |
| 5.513495107049883 | -0.448 | -0.016 | 0.147 |
| 5.516636699703473 | -0.449 | -0.019 | 0.147 |
| 5.519778292357062 | -0.449 | -0.022 | 0.147 |
| 5.522919885010652 | -0.449 | -0.025 | 0.146 |
| 5.526061477664242 | -0.449 | -0.028 | 0.146 |
| 5.529203070317831 | -0.449 | -0.031 | 0.145 |
| 5.532344662971421 | -0.45 | -0.034 | 0.145 |
| 5.535486255625011 | -0.45 | -0.037 | 0.144 |
| 5.5386278482786 | -0.45 | -0.041 | 0.144 |
| 5.54176944093219 | -0.45 | -0.044 | 0.143 |
| 5.544911033585779 | -0.451 | -0.047 | 0.142 |
| 5.54805262623937 | -0.451 | -0.05 | 0.142 |
| 5.551194218892959 | -0.451 | -0.053 | 0.141 |
| 5.554335811546548 | -0.451 | -0.056 | 0.14 |
| 5.557477404200137 | -0.451 | -0.059 | 0.139 |
| 5.560618996853727 | -0.451 | -0.062 | 0.139 |
| 5.563760589507317 | -0.452 | -0.065 | 0.138 |
| 5.566902182160906 | -0.452 | -0.068 | 0.137 |
| 5.570043774814496 | -0.452 | -0.071 | 0.136 |
| 5.573185367468086 | -0.452 | -0.073 | 0.135 |
| 5.576326960121675 | -0.452 | -0.076 | 0.134 |
| 5.579468552775264 | -0.452 | -0.079 | 0.133 |
| 5.582610145428854 | -0.453 | -0.082 | 0.132 |
| 5.585751738082444 | -0.453 | -0.085 | 0.131 |
| 5.588893330736034 | -0.453 | -0.088 | 0.129 |
| 5.592034923389623 | -0.453 | -0.09 | 0.128 |
| 5.595176516043213 | -0.453 | -0.093 | 0.127 |
| 5.598318108696803 | -0.453 | -0.096 | 0.126 |
| 5.601459701350392 | -0.453 | -0.099 | 0.124 |
| 5.604601294003982 | -0.453 | -0.101 | 0.123 |
| 5.607742886657571 | -0.454 | -0.104 | 0.121 |
| 5.610884479311161 | -0.454 | -0.107 | 0.12 |
| 5.61402607196475 | -0.454 | -0.109 | 0.118 |
| 5.61716766461834 | -0.454 | -0.112 | 0.117 |
| 5.62030925727193 | -0.454 | -0.114 | 0.115 |
| 5.623450849925519 | -0.454 | -0.117 | 0.113 |
| 5.626592442579109 | -0.454 | -0.119 | 0.112 |
| 5.629734035232698 | -0.454 | -0.122 | 0.11 |
| 5.632875627886288 | -0.454 | -0.124 | 0.108 |
| 5.636017220539878 | -0.455 | -0.127 | 0.106 |
| 5.639158813193467 | -0.455 | -0.129 | 0.104 |
| 5.642300405847057 | -0.455 | -0.131 | 0.102 |
| 5.645441998500646 | -0.455 | -0.134 | 0.1 |
| 5.648583591154236 | -0.455 | -0.136 | 0.098 |
| 5.651725183807825 | -0.455 | -0.138 | 0.096 |
| 5.654866776461415 | -0.455 | -0.141 | 0.094 |
| 5.658008369115005 | -0.455 | -0.143 | 0.091 |
| 5.661149961768594 | -0.455 | -0.145 | 0.089 |
| 5.664291554422184 | -0.455 | -0.147 | 0.087 |
| 5.667433147075774 | -0.455 | -0.149 | 0.085 |
| 5.670574739729363 | -0.455 | -0.151 | 0.082 |
| 5.673716332382953 | -0.455 | -0.153 | 0.08 |
| 5.676857925036542 | -0.456 | -0.155 | 0.077 |
| 5.679999517690132 | -0.456 | -0.157 | 0.075 |
| 5.683141110343721 | -0.456 | -0.159 | 0.072 |
| 5.686282702997311 | -0.456 | -0.161 | 0.069 |
| 5.689424295650901 | -0.456 | -0.163 | 0.067 |
| 5.69256588830449 | -0.456 | -0.165 | 0.064 |
| 5.69570748095808 | -0.456 | -0.167 | 0.061 |
| 5.69884907361167 | -0.456 | -0.168 | 0.058 |
| 5.701990666265259 | -0.456 | -0.17 | 0.056 |
| 5.705132258918849 | -0.456 | -0.172 | 0.053 |
| 5.708273851572438 | -0.456 | -0.173 | 0.05 |
| 5.711415444226028 | -0.456 | -0.175 | 0.047 |
| 5.714557036879618 | -0.456 | -0.177 | 0.044 |
| 5.717698629533207 | -0.456 | -0.178 | 0.041 |
| 5.720840222186797 | -0.456 | -0.18 | 0.038 |
| 5.723981814840386 | -0.456 | -0.181 | 0.035 |
| 5.727123407493976 | -0.456 | -0.183 | 0.032 |
| 5.730265000147565 | -0.456 | -0.184 | 0.029 |
| 5.733406592801155 | -0.456 | -0.186 | 0.026 |
| 5.736548185454744 | -0.456 | -0.187 | 0.023 |
| 5.739689778108334 | -0.456 | -0.188 | 0.02 |
| 5.742831370761924 | -0.456 | -0.19 | 0.017 |
| 5.745972963415514 | -0.456 | -0.191 | 0.014 |
| 5.749114556069103 | -0.457 | -0.192 | 0.01 |
| 5.752256148722693 | -0.457 | -0.194 | 0.007 |
| 5.755397741376282 | -0.457 | -0.195 | 0.004 |
| 5.758539334029872 | -0.457 | -0.196 | 0.001 |
| 5.761680926683462 | -0.457 | -0.197 | -0.002 |
| 5.764822519337051 | -0.457 | -0.198 | -0.005 |
| 5.767964111990641 | -0.457 | -0.199 | -0.008 |
| 5.77110570464423 | -0.457 | -0.2 | -0.012 |
| 5.77424729729782 | -0.457 | -0.201 | -0.015 |
| 5.77738888995141 | -0.457 | -0.202 | -0.018 |
| 5.780530482605 | -0.457 | -0.203 | -0.021 |
| 5.783672075258588 | -0.457 | -0.204 | -0.024 |
| 5.786813667912178 | -0.457 | -0.205 | -0.027 |
| 5.789955260565768 | -0.457 | -0.206 | -0.03 |
| 5.793096853219358 | -0.457 | -0.207 | -0.033 |
| 5.796238445872947 | -0.457 | -0.208 | -0.036 |
| 5.799380038526537 | -0.457 | -0.209 | -0.039 |
| 5.802521631180126 | -0.457 | -0.209 | -0.042 |
| 5.805663223833715 | -0.457 | -0.21 | -0.045 |
| 5.808804816487306 | -0.457 | -0.211 | -0.048 |
| 5.811946409140895 | -0.457 | -0.212 | -0.051 |
| 5.815088001794485 | -0.457 | -0.212 | -0.054 |
| 5.818229594448074 | -0.457 | -0.213 | -0.057 |
| 5.821371187101663 | -0.457 | -0.214 | -0.059 |
| 5.824512779755254 | -0.457 | -0.214 | -0.062 |
| 5.827654372408843 | -0.457 | -0.215 | -0.065 |
| 5.830795965062433 | -0.457 | -0.216 | -0.068 |
| 5.833937557716022 | -0.457 | -0.216 | -0.07 |
| 5.837079150369612 | -0.457 | -0.217 | -0.073 |
| 5.840220743023201 | -0.457 | -0.217 | -0.075 |
| 5.843362335676791 | -0.457 | -0.218 | -0.078 |
| 5.846503928330381 | -0.457 | -0.218 | -0.08 |
| 5.84964552098397 | -0.457 | -0.219 | -0.083 |
| 5.85278711363756 | -0.457 | -0.219 | -0.085 |
| 5.85592870629115 | -0.457 | -0.22 | -0.088 |
| 5.85907029894474 | -0.457 | -0.22 | -0.09 |
| 5.862211891598329 | -0.457 | -0.22 | -0.092 |
| 5.865353484251918 | -0.457 | -0.221 | -0.094 |
| 5.868495076905508 | -0.457 | -0.221 | -0.097 |
| 5.871636669559098 | -0.457 | -0.222 | -0.099 |
| 5.874778262212687 | -0.457 | -0.222 | -0.101 |
| 5.877919854866277 | -0.457 | -0.222 | -0.103 |
| 5.881061447519866 | -0.457 | -0.223 | -0.105 |
| 5.884203040173456 | -0.457 | -0.223 | -0.107 |
| 5.887344632827046 | -0.457 | -0.223 | -0.109 |
| 5.890486225480635 | -0.457 | -0.223 | -0.11 |
| 5.893627818134224 | -0.457 | -0.224 | -0.112 |
| 5.896769410787814 | -0.457 | -0.224 | -0.114 |
| 5.899911003441404 | -0.457 | -0.224 | -0.116 |
| 5.903052596094994 | -0.457 | -0.225 | -0.117 |
| 5.906194188748583 | -0.457 | -0.225 | -0.119 |
| 5.909335781402172 | -0.457 | -0.225 | -0.12 |
| 5.912477374055762 | -0.457 | -0.225 | -0.122 |
| 5.915618966709352 | -0.457 | -0.225 | -0.123 |
| 5.918760559362942 | -0.457 | -0.226 | -0.125 |
| 5.921902152016531 | -0.457 | -0.226 | -0.126 |
| 5.92504374467012 | -0.457 | -0.226 | -0.127 |
| 5.92818533732371 | -0.457 | -0.226 | -0.129 |
| 5.9313269299773 | -0.457 | -0.226 | -0.13 |
| 5.93446852263089 | -0.457 | -0.226 | -0.131 |
| 5.93761011528448 | -0.457 | -0.226 | -0.132 |
| 5.940751707938068 | -0.457 | -0.227 | -0.133 |
| 5.943893300591658 | -0.457 | -0.227 | -0.134 |
| 5.947034893245248 | -0.457 | -0.227 | -0.135 |
| 5.950176485898837 | -0.457 | -0.227 | -0.136 |
| 5.953318078552427 | -0.457 | -0.227 | -0.137 |
| 5.956459671206017 | -0.457 | -0.227 | -0.138 |
| 5.959601263859606 | -0.457 | -0.227 | -0.139 |
| 5.962742856513196 | -0.457 | -0.227 | -0.14 |
| 5.965884449166785 | -0.457 | -0.227 | -0.14 |
| 5.969026041820375 | -0.457 | -0.228 | -0.141 |
| 5.972167634473964 | -0.457 | -0.228 | -0.142 |
| 5.975309227127554 | -0.457 | -0.228 | -0.142 |
| 5.978450819781144 | -0.457 | -0.228 | -0.143 |
| 5.981592412434733 | -0.457 | -0.228 | -0.144 |
| 5.984734005088323 | -0.457 | -0.228 | -0.144 |
| 5.987875597741913 | -0.457 | -0.228 | -0.145 |
| 5.991017190395502 | -0.457 | -0.228 | -0.145 |
| 5.994158783049092 | -0.457 | -0.228 | -0.146 |
| 5.997300375702681 | -0.457 | -0.228 | -0.146 |
| 6.000441968356271 | -0.457 | -0.228 | -0.147 |
| 6.003583561009861 | -0.457 | -0.228 | -0.147 |
| 6.00672515366345 | -0.457 | -0.228 | -0.147 |
| 6.00986674631704 | -0.457 | -0.228 | -0.148 |
| 6.01300833897063 | -0.457 | -0.228 | -0.148 |
| 6.01614993162422 | -0.457 | -0.228 | -0.149 |
| 6.019291524277808 | -0.457 | -0.228 | -0.149 |
| 6.022433116931398 | -0.457 | -0.228 | -0.149 |
| 6.025574709584988 | -0.457 | -0.228 | -0.149 |
| 6.028716302238577 | -0.457 | -0.228 | -0.15 |
| 6.031857894892167 | -0.457 | -0.228 | -0.15 |
| 6.034999487545757 | -0.457 | -0.228 | -0.15 |
| 6.038141080199346 | -0.457 | -0.228 | -0.15 |
| 6.041282672852935 | -0.457 | -0.228 | -0.15 |
| 6.044424265506525 | -0.457 | -0.228 | -0.151 |
| 6.047565858160115 | -0.457 | -0.228 | -0.151 |
| 6.050707450813704 | -0.457 | -0.228 | -0.151 |
| 6.053849043467294 | -0.457 | -0.228 | -0.151 |
| 6.056990636120884 | -0.457 | -0.228 | -0.151 |
| 6.060132228774473 | -0.457 | -0.228 | -0.151 |
| 6.063273821428063 | -0.457 | -0.228 | -0.151 |
| 6.066415414081653 | -0.457 | -0.229 | -0.151 |
| 6.069557006735242 | -0.457 | -0.229 | -0.152 |
| 6.072698599388831 | -0.457 | -0.229 | -0.152 |
| 6.07584019204242 | -0.457 | -0.229 | -0.152 |
| 6.078981784696011 | -0.457 | -0.229 | -0.152 |
| 6.082123377349601 | -0.457 | -0.229 | -0.152 |
| 6.08526497000319 | -0.457 | -0.229 | -0.152 |
| 6.08840656265678 | -0.457 | -0.229 | -0.152 |
| 6.09154815531037 | -0.457 | -0.229 | -0.152 |
| 6.094689747963959 | -0.457 | -0.229 | -0.152 |
| 6.097831340617549 | -0.457 | -0.229 | -0.152 |
| 6.100972933271138 | -0.457 | -0.229 | -0.152 |
| 6.104114525924728 | -0.457 | -0.229 | -0.152 |
| 6.107256118578317 | -0.457 | -0.229 | -0.152 |
| 6.110397711231907 | -0.457 | -0.229 | -0.152 |
| 6.113539303885497 | -0.457 | -0.229 | -0.152 |
| 6.116680896539086 | -0.457 | -0.229 | -0.152 |
| 6.119822489192675 | -0.457 | -0.229 | -0.152 |
| 6.122964081846265 | -0.457 | -0.229 | -0.152 |
| 6.126105674499855 | -0.457 | -0.229 | -0.152 |
| 6.129247267153445 | -0.457 | -0.229 | -0.152 |
| 6.132388859807034 | -0.457 | -0.229 | -0.152 |
| 6.135530452460624 | -0.457 | -0.229 | -0.152 |
| 6.138672045114213 | -0.457 | -0.229 | -0.152 |
| 6.141813637767803 | -0.457 | -0.229 | -0.152 |
| 6.144955230421393 | -0.457 | -0.229 | -0.152 |
| 6.148096823074982 | -0.457 | -0.229 | -0.152 |
| 6.151238415728571 | -0.457 | -0.229 | -0.152 |
| 6.154380008382161 | -0.457 | -0.229 | -0.152 |
| 6.157521601035751 | -0.457 | -0.229 | -0.152 |
| 6.16066319368934 | -0.457 | -0.229 | -0.152 |
| 6.16380478634293 | -0.457 | -0.229 | -0.152 |
| 6.16694637899652 | -0.457 | -0.229 | -0.152 |
| 6.170087971650109 | -0.457 | -0.229 | -0.152 |
| 6.173229564303698 | -0.457 | -0.229 | -0.152 |
| 6.176371156957289 | -0.457 | -0.229 | -0.152 |
| 6.179512749610878 | -0.457 | -0.229 | -0.152 |
| 6.182654342264468 | -0.457 | -0.229 | -0.152 |
| 6.185795934918057 | -0.457 | -0.229 | -0.152 |
| 6.188937527571647 | -0.457 | -0.229 | -0.152 |
| 6.192079120225237 | -0.457 | -0.229 | -0.152 |
| 6.195220712878826 | -0.457 | -0.229 | -0.152 |
| 6.198362305532415 | -0.457 | -0.229 | -0.152 |
| 6.201503898186005 | -0.457 | -0.229 | -0.152 |
| 6.204645490839594 | -0.457 | -0.229 | -0.152 |
| 6.207787083493184 | -0.457 | -0.229 | -0.152 |
| 6.210928676146774 | -0.457 | -0.229 | -0.152 |
| 6.214070268800364 | -0.457 | -0.229 | -0.152 |
| 6.217211861453953 | -0.457 | -0.229 | -0.152 |
| 6.220353454107543 | -0.457 | -0.229 | -0.152 |
| 6.223495046761133 | -0.457 | -0.229 | -0.152 |
| 6.226636639414722 | -0.457 | -0.229 | -0.152 |
| 6.229778232068312 | -0.457 | -0.229 | -0.152 |
| 6.232919824721901 | -0.457 | -0.229 | -0.152 |
| 6.236061417375491 | -0.457 | -0.229 | -0.152 |
| 6.23920301002908 | -0.457 | -0.229 | -0.152 |
| 6.24234460268267 | -0.457 | -0.229 | -0.152 |
| 6.24548619533626 | -0.457 | -0.229 | -0.152 |
| 6.24862778798985 | -0.457 | -0.229 | -0.152 |
| 6.251769380643438 | -0.457 | -0.229 | -0.152 |
| 6.254910973297028 | -0.457 | -0.229 | -0.152 |
| 6.258052565950618 | -0.457 | -0.229 | -0.152 |
| 6.261194158604208 | -0.457 | -0.229 | -0.152 |
| 6.264335751257797 | -0.457 | -0.229 | -0.152 |
| 6.267477343911387 | -0.457 | -0.229 | -0.152 |
| 6.270618936564976 | -0.457 | -0.229 | -0.152 |
| 6.273760529218566 | -0.457 | -0.229 | -0.152 |
| 6.276902121872155 | -0.457 | -0.229 | -0.152 |
| 6.280043714525745 | -0.457 | -0.229 | -0.152 |
| 6.283185307179335 | -0.457 | -0.229 | -0.152 |